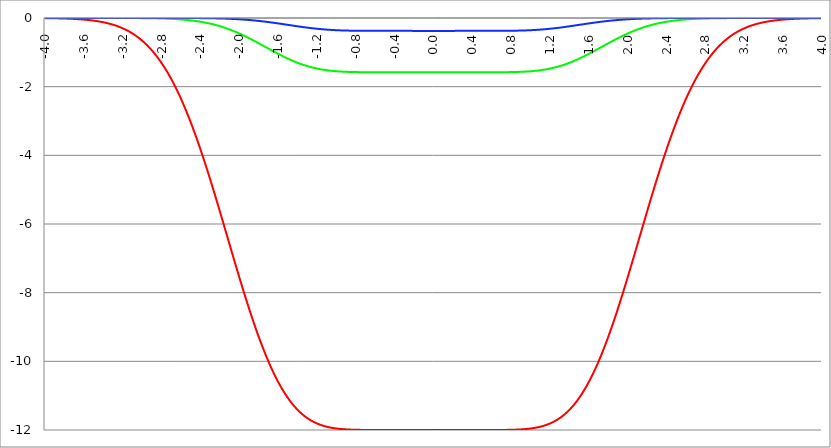
| Category | Series 1 | Series 0 | Series 2 |
|---|---|---|---|
| -4.0 | -0.005 | 0 | 0 |
| -3.996 | -0.005 | 0 | 0 |
| -3.992 | -0.005 | 0 | 0 |
| -3.988 | -0.005 | 0 | 0 |
| -3.984 | -0.005 | 0 | 0 |
| -3.98 | -0.005 | 0 | 0 |
| -3.976 | -0.006 | 0 | 0 |
| -3.972 | -0.006 | 0 | 0 |
| -3.968 | -0.006 | 0 | 0 |
| -3.964 | -0.006 | 0 | 0 |
| -3.96 | -0.006 | 0 | 0 |
| -3.956 | -0.006 | 0 | 0 |
| -3.952 | -0.006 | 0 | 0 |
| -3.948 | -0.007 | 0 | 0 |
| -3.944 | -0.007 | 0 | 0 |
| -3.94 | -0.007 | 0 | 0 |
| -3.936 | -0.007 | 0 | 0 |
| -3.932 | -0.007 | 0 | 0 |
| -3.928 | -0.007 | 0 | 0 |
| -3.924 | -0.008 | 0 | 0 |
| -3.92 | -0.008 | 0 | 0 |
| -3.916 | -0.008 | 0 | 0 |
| -3.912 | -0.008 | 0 | 0 |
| -3.908 | -0.008 | 0 | 0 |
| -3.904 | -0.009 | 0 | 0 |
| -3.9 | -0.009 | 0 | 0 |
| -3.896 | -0.009 | 0 | 0 |
| -3.892 | -0.009 | 0 | 0 |
| -3.888 | -0.009 | 0 | 0 |
| -3.884 | -0.01 | 0 | 0 |
| -3.88 | -0.01 | 0 | 0 |
| -3.876 | -0.01 | 0 | 0 |
| -3.872 | -0.01 | 0 | 0 |
| -3.868 | -0.011 | 0 | 0 |
| -3.864 | -0.011 | 0 | 0 |
| -3.86 | -0.011 | 0 | 0 |
| -3.856 | -0.011 | 0 | 0 |
| -3.852 | -0.012 | 0 | 0 |
| -3.848 | -0.012 | 0 | 0 |
| -3.844 | -0.012 | 0 | 0 |
| -3.84 | -0.012 | 0 | 0 |
| -3.836 | -0.013 | 0 | 0 |
| -3.832 | -0.013 | 0 | 0 |
| -3.828 | -0.013 | 0 | 0 |
| -3.824 | -0.014 | 0 | 0 |
| -3.82 | -0.014 | 0 | 0 |
| -3.816 | -0.014 | 0 | 0 |
| -3.812 | -0.015 | 0 | 0 |
| -3.808 | -0.015 | 0 | 0 |
| -3.804 | -0.015 | 0 | 0 |
| -3.8 | -0.016 | 0 | 0 |
| -3.796 | -0.016 | 0 | 0 |
| -3.792 | -0.016 | 0 | 0 |
| -3.788 | -0.017 | 0 | 0 |
| -3.784 | -0.017 | 0 | 0 |
| -3.78 | -0.018 | 0 | 0 |
| -3.776 | -0.018 | 0 | 0 |
| -3.772 | -0.018 | 0 | 0 |
| -3.768 | -0.019 | 0 | 0 |
| -3.764 | -0.019 | 0 | 0 |
| -3.76 | -0.02 | 0 | 0 |
| -3.756 | -0.02 | 0 | 0 |
| -3.752 | -0.02 | 0 | 0 |
| -3.748 | -0.021 | 0 | 0 |
| -3.744 | -0.021 | 0 | 0 |
| -3.74 | -0.022 | 0 | 0 |
| -3.736 | -0.022 | 0 | 0 |
| -3.732 | -0.023 | 0 | 0 |
| -3.728 | -0.023 | 0 | 0 |
| -3.724 | -0.024 | 0 | 0 |
| -3.72 | -0.024 | 0 | 0 |
| -3.716 | -0.025 | 0 | 0 |
| -3.712 | -0.025 | 0 | 0 |
| -3.708 | -0.026 | 0 | 0 |
| -3.704 | -0.027 | 0 | 0 |
| -3.7 | -0.027 | 0 | 0 |
| -3.696 | -0.028 | 0 | 0 |
| -3.692 | -0.028 | 0 | 0 |
| -3.688 | -0.029 | 0 | 0 |
| -3.684 | -0.03 | 0 | 0 |
| -3.68 | -0.03 | 0 | 0 |
| -3.676 | -0.031 | 0 | 0 |
| -3.672 | -0.032 | 0 | 0 |
| -3.668 | -0.032 | 0 | 0 |
| -3.664 | -0.033 | 0 | 0 |
| -3.66 | -0.034 | 0 | 0 |
| -3.656 | -0.034 | 0 | 0 |
| -3.652 | -0.035 | 0 | 0 |
| -3.648 | -0.036 | 0 | 0 |
| -3.644 | -0.037 | 0 | 0 |
| -3.64 | -0.037 | 0 | 0 |
| -3.636 | -0.038 | 0 | 0 |
| -3.632 | -0.039 | 0 | 0 |
| -3.628 | -0.04 | 0 | 0 |
| -3.624 | -0.041 | 0 | 0 |
| -3.62 | -0.042 | 0 | 0 |
| -3.616 | -0.043 | 0 | 0 |
| -3.612 | -0.043 | 0 | 0 |
| -3.608 | -0.044 | 0 | 0 |
| -3.604 | -0.045 | 0 | 0 |
| -3.6 | -0.046 | 0 | 0 |
| -3.596 | -0.047 | 0 | 0 |
| -3.592 | -0.048 | 0 | 0 |
| -3.588 | -0.049 | 0 | 0 |
| -3.584 | -0.05 | 0 | 0 |
| -3.58 | -0.051 | 0 | 0 |
| -3.576 | -0.052 | 0 | 0 |
| -3.572 | -0.053 | 0 | 0 |
| -3.568 | -0.054 | 0 | 0 |
| -3.564 | -0.056 | 0 | 0 |
| -3.56 | -0.057 | 0 | 0 |
| -3.556 | -0.058 | 0 | 0 |
| -3.552 | -0.059 | 0 | 0 |
| -3.548 | -0.06 | 0 | 0 |
| -3.544 | -0.061 | 0 | 0 |
| -3.54 | -0.063 | 0 | 0 |
| -3.536 | -0.064 | 0 | 0 |
| -3.532 | -0.065 | 0 | 0 |
| -3.528 | -0.067 | 0 | 0 |
| -3.524 | -0.068 | 0 | 0 |
| -3.52 | -0.069 | 0 | 0 |
| -3.516 | -0.071 | 0 | 0 |
| -3.512 | -0.072 | 0 | 0 |
| -3.508 | -0.074 | 0 | 0 |
| -3.504 | -0.075 | 0 | 0 |
| -3.5 | -0.077 | 0 | 0 |
| -3.496 | -0.078 | 0 | 0 |
| -3.492 | -0.08 | 0 | 0 |
| -3.488 | -0.081 | 0 | 0 |
| -3.484 | -0.083 | 0 | 0 |
| -3.48 | -0.084 | 0 | 0 |
| -3.476 | -0.086 | 0 | 0 |
| -3.472 | -0.088 | 0 | 0 |
| -3.467999999999999 | -0.089 | 0 | 0 |
| -3.463999999999999 | -0.091 | 0 | 0 |
| -3.459999999999999 | -0.093 | 0 | 0 |
| -3.455999999999999 | -0.095 | 0 | 0 |
| -3.451999999999999 | -0.097 | 0 | 0 |
| -3.447999999999999 | -0.099 | 0 | 0 |
| -3.443999999999999 | -0.1 | 0 | 0 |
| -3.439999999999999 | -0.102 | 0 | 0 |
| -3.435999999999999 | -0.104 | 0 | 0 |
| -3.431999999999999 | -0.106 | 0 | 0 |
| -3.427999999999999 | -0.108 | 0 | 0 |
| -3.423999999999999 | -0.111 | 0 | 0 |
| -3.419999999999999 | -0.113 | 0 | 0 |
| -3.415999999999999 | -0.115 | 0 | 0 |
| -3.411999999999999 | -0.117 | 0 | 0 |
| -3.407999999999999 | -0.119 | 0 | 0 |
| -3.403999999999999 | -0.121 | 0 | 0 |
| -3.399999999999999 | -0.124 | 0 | 0 |
| -3.395999999999999 | -0.126 | 0 | 0 |
| -3.391999999999999 | -0.128 | 0 | 0 |
| -3.387999999999999 | -0.131 | 0 | 0 |
| -3.383999999999999 | -0.133 | 0 | 0 |
| -3.379999999999999 | -0.136 | 0 | 0 |
| -3.375999999999999 | -0.138 | 0 | 0 |
| -3.371999999999999 | -0.141 | 0 | 0 |
| -3.367999999999999 | -0.144 | 0 | 0 |
| -3.363999999999999 | -0.146 | 0 | 0 |
| -3.359999999999999 | -0.149 | 0 | 0 |
| -3.355999999999999 | -0.152 | 0 | 0 |
| -3.351999999999999 | -0.154 | 0 | 0 |
| -3.347999999999999 | -0.157 | 0 | 0 |
| -3.343999999999999 | -0.16 | 0 | 0 |
| -3.339999999999999 | -0.163 | 0 | 0 |
| -3.335999999999999 | -0.166 | 0 | 0 |
| -3.331999999999999 | -0.169 | 0 | 0 |
| -3.327999999999999 | -0.172 | 0 | 0 |
| -3.323999999999999 | -0.175 | 0 | 0 |
| -3.319999999999999 | -0.179 | 0 | 0 |
| -3.315999999999999 | -0.182 | 0 | 0 |
| -3.311999999999999 | -0.185 | 0 | 0 |
| -3.307999999999999 | -0.188 | 0 | 0 |
| -3.303999999999999 | -0.192 | 0 | 0 |
| -3.299999999999999 | -0.195 | 0 | 0 |
| -3.295999999999999 | -0.199 | -0.001 | 0 |
| -3.291999999999999 | -0.202 | -0.001 | 0 |
| -3.288 | -0.206 | -0.001 | 0 |
| -3.284 | -0.209 | -0.001 | 0 |
| -3.279999999999999 | -0.213 | -0.001 | 0 |
| -3.275999999999999 | -0.217 | -0.001 | 0 |
| -3.271999999999999 | -0.221 | -0.001 | 0 |
| -3.268 | -0.225 | -0.001 | 0 |
| -3.264 | -0.229 | -0.001 | 0 |
| -3.259999999999999 | -0.233 | -0.001 | 0 |
| -3.255999999999999 | -0.237 | -0.001 | 0 |
| -3.251999999999999 | -0.241 | -0.001 | 0 |
| -3.248 | -0.245 | -0.001 | 0 |
| -3.244 | -0.249 | -0.001 | 0 |
| -3.239999999999999 | -0.254 | -0.001 | 0 |
| -3.235999999999999 | -0.258 | -0.001 | 0 |
| -3.231999999999999 | -0.262 | -0.001 | 0 |
| -3.228 | -0.267 | -0.001 | 0 |
| -3.224 | -0.271 | -0.001 | 0 |
| -3.219999999999999 | -0.276 | -0.001 | 0 |
| -3.215999999999999 | -0.281 | -0.001 | 0 |
| -3.211999999999999 | -0.286 | -0.001 | 0 |
| -3.208 | -0.29 | -0.001 | 0 |
| -3.204 | -0.295 | -0.001 | 0 |
| -3.199999999999999 | -0.3 | -0.001 | 0 |
| -3.195999999999999 | -0.305 | -0.001 | 0 |
| -3.191999999999999 | -0.311 | -0.001 | 0 |
| -3.188 | -0.316 | -0.001 | 0 |
| -3.184 | -0.321 | -0.001 | 0 |
| -3.179999999999999 | -0.326 | -0.001 | 0 |
| -3.175999999999999 | -0.332 | -0.001 | 0 |
| -3.171999999999999 | -0.337 | -0.001 | 0 |
| -3.168 | -0.343 | -0.001 | 0 |
| -3.164 | -0.349 | -0.001 | 0 |
| -3.159999999999999 | -0.354 | -0.001 | 0 |
| -3.155999999999999 | -0.36 | -0.001 | 0 |
| -3.151999999999999 | -0.366 | -0.001 | 0 |
| -3.148 | -0.372 | -0.001 | 0 |
| -3.144 | -0.378 | -0.002 | 0 |
| -3.139999999999999 | -0.384 | -0.002 | 0 |
| -3.135999999999999 | -0.391 | -0.002 | 0 |
| -3.131999999999999 | -0.397 | -0.002 | 0 |
| -3.128 | -0.403 | -0.002 | 0 |
| -3.124 | -0.41 | -0.002 | 0 |
| -3.119999999999999 | -0.416 | -0.002 | 0 |
| -3.115999999999999 | -0.423 | -0.002 | 0 |
| -3.111999999999999 | -0.43 | -0.002 | 0 |
| -3.108 | -0.437 | -0.002 | 0 |
| -3.104 | -0.444 | -0.002 | 0 |
| -3.099999999999999 | -0.451 | -0.002 | 0 |
| -3.095999999999999 | -0.458 | -0.002 | 0 |
| -3.091999999999999 | -0.465 | -0.002 | 0 |
| -3.088 | -0.472 | -0.002 | 0 |
| -3.084 | -0.48 | -0.002 | 0 |
| -3.079999999999999 | -0.487 | -0.002 | 0 |
| -3.075999999999999 | -0.495 | -0.002 | 0 |
| -3.071999999999999 | -0.503 | -0.003 | 0 |
| -3.068 | -0.51 | -0.003 | 0 |
| -3.064 | -0.518 | -0.003 | 0 |
| -3.059999999999999 | -0.526 | -0.003 | 0 |
| -3.055999999999999 | -0.535 | -0.003 | 0 |
| -3.051999999999999 | -0.543 | -0.003 | 0 |
| -3.048 | -0.551 | -0.003 | 0 |
| -3.044 | -0.56 | -0.003 | 0 |
| -3.039999999999999 | -0.568 | -0.003 | 0 |
| -3.035999999999999 | -0.577 | -0.003 | 0 |
| -3.031999999999999 | -0.585 | -0.003 | 0 |
| -3.028 | -0.594 | -0.003 | 0 |
| -3.024 | -0.603 | -0.004 | 0 |
| -3.019999999999999 | -0.612 | -0.004 | 0 |
| -3.015999999999999 | -0.622 | -0.004 | 0 |
| -3.011999999999999 | -0.631 | -0.004 | 0 |
| -3.008 | -0.64 | -0.004 | 0 |
| -3.004 | -0.65 | -0.004 | 0 |
| -2.999999999999999 | -0.66 | -0.004 | 0 |
| -2.995999999999999 | -0.669 | -0.004 | 0 |
| -2.991999999999999 | -0.679 | -0.004 | 0 |
| -2.988 | -0.689 | -0.004 | 0 |
| -2.984 | -0.699 | -0.005 | 0 |
| -2.979999999999999 | -0.71 | -0.005 | 0 |
| -2.975999999999999 | -0.72 | -0.005 | 0 |
| -2.971999999999999 | -0.73 | -0.005 | 0 |
| -2.968 | -0.741 | -0.005 | 0 |
| -2.964 | -0.752 | -0.005 | 0 |
| -2.959999999999999 | -0.763 | -0.005 | 0 |
| -2.955999999999999 | -0.774 | -0.005 | 0 |
| -2.951999999999999 | -0.785 | -0.006 | 0 |
| -2.948 | -0.796 | -0.006 | 0 |
| -2.944 | -0.807 | -0.006 | 0 |
| -2.939999999999999 | -0.819 | -0.006 | 0 |
| -2.935999999999999 | -0.831 | -0.006 | 0 |
| -2.931999999999999 | -0.842 | -0.006 | 0 |
| -2.928 | -0.854 | -0.007 | 0 |
| -2.924 | -0.866 | -0.007 | 0 |
| -2.919999999999999 | -0.878 | -0.007 | 0 |
| -2.915999999999999 | -0.891 | -0.007 | 0 |
| -2.911999999999999 | -0.903 | -0.007 | 0 |
| -2.908 | -0.916 | -0.007 | 0 |
| -2.904 | -0.928 | -0.008 | 0 |
| -2.899999999999999 | -0.941 | -0.008 | 0 |
| -2.895999999999999 | -0.954 | -0.008 | 0 |
| -2.891999999999999 | -0.967 | -0.008 | 0 |
| -2.887999999999999 | -0.981 | -0.008 | 0 |
| -2.883999999999999 | -0.994 | -0.009 | 0 |
| -2.879999999999999 | -1.008 | -0.009 | 0 |
| -2.875999999999999 | -1.021 | -0.009 | 0 |
| -2.871999999999999 | -1.035 | -0.009 | 0 |
| -2.867999999999999 | -1.049 | -0.009 | 0 |
| -2.863999999999999 | -1.063 | -0.01 | 0 |
| -2.859999999999999 | -1.078 | -0.01 | 0 |
| -2.855999999999999 | -1.092 | -0.01 | 0 |
| -2.851999999999999 | -1.107 | -0.01 | 0 |
| -2.847999999999999 | -1.121 | -0.011 | 0 |
| -2.843999999999999 | -1.136 | -0.011 | 0 |
| -2.839999999999999 | -1.151 | -0.011 | 0 |
| -2.835999999999999 | -1.166 | -0.011 | 0 |
| -2.831999999999999 | -1.182 | -0.012 | 0 |
| -2.827999999999999 | -1.197 | -0.012 | 0 |
| -2.823999999999999 | -1.213 | -0.012 | 0 |
| -2.819999999999999 | -1.229 | -0.013 | 0 |
| -2.815999999999999 | -1.245 | -0.013 | 0 |
| -2.811999999999999 | -1.261 | -0.013 | 0 |
| -2.807999999999999 | -1.277 | -0.014 | 0 |
| -2.803999999999999 | -1.293 | -0.014 | 0 |
| -2.799999999999999 | -1.31 | -0.014 | 0 |
| -2.795999999999999 | -1.327 | -0.015 | 0 |
| -2.791999999999999 | -1.344 | -0.015 | 0 |
| -2.787999999999999 | -1.361 | -0.015 | 0 |
| -2.783999999999999 | -1.378 | -0.016 | 0 |
| -2.779999999999999 | -1.395 | -0.016 | 0 |
| -2.775999999999999 | -1.413 | -0.016 | 0 |
| -2.771999999999999 | -1.431 | -0.017 | 0 |
| -2.767999999999999 | -1.448 | -0.017 | 0 |
| -2.763999999999999 | -1.466 | -0.017 | 0 |
| -2.759999999999999 | -1.485 | -0.018 | 0 |
| -2.755999999999999 | -1.503 | -0.018 | 0 |
| -2.751999999999999 | -1.522 | -0.019 | 0 |
| -2.747999999999999 | -1.54 | -0.019 | 0 |
| -2.743999999999999 | -1.559 | -0.02 | 0 |
| -2.739999999999999 | -1.578 | -0.02 | 0 |
| -2.735999999999999 | -1.597 | -0.02 | 0 |
| -2.731999999999999 | -1.617 | -0.021 | 0 |
| -2.727999999999999 | -1.636 | -0.021 | 0 |
| -2.723999999999999 | -1.656 | -0.022 | 0 |
| -2.719999999999999 | -1.676 | -0.022 | 0 |
| -2.715999999999999 | -1.696 | -0.023 | 0 |
| -2.711999999999999 | -1.716 | -0.023 | 0 |
| -2.707999999999999 | -1.736 | -0.024 | 0 |
| -2.703999999999999 | -1.757 | -0.024 | 0 |
| -2.699999999999999 | -1.778 | -0.025 | 0 |
| -2.695999999999999 | -1.799 | -0.025 | 0 |
| -2.691999999999999 | -1.82 | -0.026 | 0 |
| -2.687999999999999 | -1.841 | -0.027 | 0 |
| -2.683999999999999 | -1.862 | -0.027 | -0.001 |
| -2.679999999999999 | -1.884 | -0.028 | -0.001 |
| -2.675999999999999 | -1.906 | -0.028 | -0.001 |
| -2.671999999999999 | -1.928 | -0.029 | -0.001 |
| -2.667999999999999 | -1.95 | -0.03 | -0.001 |
| -2.663999999999999 | -1.972 | -0.03 | -0.001 |
| -2.659999999999999 | -1.994 | -0.031 | -0.001 |
| -2.655999999999999 | -2.017 | -0.032 | -0.001 |
| -2.651999999999999 | -2.04 | -0.032 | -0.001 |
| -2.647999999999999 | -2.063 | -0.033 | -0.001 |
| -2.643999999999999 | -2.086 | -0.034 | -0.001 |
| -2.639999999999999 | -2.109 | -0.034 | -0.001 |
| -2.635999999999999 | -2.133 | -0.035 | -0.001 |
| -2.631999999999999 | -2.157 | -0.036 | -0.001 |
| -2.627999999999999 | -2.18 | -0.037 | -0.001 |
| -2.623999999999999 | -2.204 | -0.037 | -0.001 |
| -2.619999999999999 | -2.229 | -0.038 | -0.001 |
| -2.615999999999999 | -2.253 | -0.039 | -0.001 |
| -2.611999999999999 | -2.278 | -0.04 | -0.001 |
| -2.607999999999999 | -2.302 | -0.041 | -0.001 |
| -2.603999999999999 | -2.327 | -0.041 | -0.001 |
| -2.599999999999999 | -2.352 | -0.042 | -0.001 |
| -2.595999999999999 | -2.378 | -0.043 | -0.001 |
| -2.591999999999999 | -2.403 | -0.044 | -0.001 |
| -2.587999999999999 | -2.429 | -0.045 | -0.001 |
| -2.583999999999999 | -2.454 | -0.046 | -0.001 |
| -2.579999999999999 | -2.48 | -0.047 | -0.001 |
| -2.575999999999999 | -2.507 | -0.048 | -0.001 |
| -2.571999999999999 | -2.533 | -0.049 | -0.001 |
| -2.567999999999999 | -2.559 | -0.05 | -0.001 |
| -2.563999999999999 | -2.586 | -0.051 | -0.001 |
| -2.559999999999999 | -2.613 | -0.052 | -0.001 |
| -2.555999999999999 | -2.64 | -0.053 | -0.001 |
| -2.551999999999999 | -2.667 | -0.054 | -0.001 |
| -2.547999999999999 | -2.694 | -0.055 | -0.001 |
| -2.543999999999999 | -2.722 | -0.056 | -0.001 |
| -2.539999999999999 | -2.75 | -0.057 | -0.002 |
| -2.535999999999999 | -2.777 | -0.058 | -0.002 |
| -2.531999999999999 | -2.806 | -0.059 | -0.002 |
| -2.527999999999999 | -2.834 | -0.06 | -0.002 |
| -2.523999999999999 | -2.862 | -0.061 | -0.002 |
| -2.519999999999999 | -2.891 | -0.063 | -0.002 |
| -2.515999999999999 | -2.919 | -0.064 | -0.002 |
| -2.511999999999999 | -2.948 | -0.065 | -0.002 |
| -2.507999999999999 | -2.977 | -0.066 | -0.002 |
| -2.503999999999999 | -3.006 | -0.068 | -0.002 |
| -2.499999999999999 | -3.036 | -0.069 | -0.002 |
| -2.495999999999999 | -3.065 | -0.07 | -0.002 |
| -2.491999999999999 | -3.095 | -0.071 | -0.002 |
| -2.487999999999999 | -3.125 | -0.073 | -0.002 |
| -2.483999999999999 | -3.155 | -0.074 | -0.002 |
| -2.479999999999999 | -3.185 | -0.076 | -0.002 |
| -2.475999999999999 | -3.216 | -0.077 | -0.002 |
| -2.471999999999999 | -3.246 | -0.078 | -0.002 |
| -2.467999999999999 | -3.277 | -0.08 | -0.003 |
| -2.463999999999999 | -3.308 | -0.081 | -0.003 |
| -2.459999999999999 | -3.339 | -0.083 | -0.003 |
| -2.455999999999999 | -3.37 | -0.084 | -0.003 |
| -2.451999999999999 | -3.401 | -0.086 | -0.003 |
| -2.447999999999999 | -3.432 | -0.087 | -0.003 |
| -2.443999999999999 | -3.464 | -0.089 | -0.003 |
| -2.439999999999999 | -3.496 | -0.091 | -0.003 |
| -2.435999999999999 | -3.528 | -0.092 | -0.003 |
| -2.431999999999999 | -3.56 | -0.094 | -0.003 |
| -2.427999999999999 | -3.592 | -0.096 | -0.003 |
| -2.423999999999999 | -3.624 | -0.097 | -0.003 |
| -2.419999999999999 | -3.657 | -0.099 | -0.003 |
| -2.415999999999999 | -3.69 | -0.101 | -0.004 |
| -2.411999999999999 | -3.722 | -0.103 | -0.004 |
| -2.407999999999999 | -3.755 | -0.104 | -0.004 |
| -2.403999999999999 | -3.788 | -0.106 | -0.004 |
| -2.399999999999999 | -3.822 | -0.108 | -0.004 |
| -2.395999999999999 | -3.855 | -0.11 | -0.004 |
| -2.391999999999999 | -3.888 | -0.112 | -0.004 |
| -2.387999999999999 | -3.922 | -0.114 | -0.004 |
| -2.383999999999999 | -3.956 | -0.116 | -0.004 |
| -2.379999999999999 | -3.99 | -0.118 | -0.005 |
| -2.375999999999999 | -4.024 | -0.12 | -0.005 |
| -2.371999999999999 | -4.058 | -0.122 | -0.005 |
| -2.367999999999998 | -4.092 | -0.124 | -0.005 |
| -2.363999999999998 | -4.127 | -0.126 | -0.005 |
| -2.359999999999998 | -4.161 | -0.128 | -0.005 |
| -2.355999999999998 | -4.196 | -0.13 | -0.005 |
| -2.351999999999998 | -4.231 | -0.132 | -0.005 |
| -2.347999999999998 | -4.266 | -0.135 | -0.006 |
| -2.343999999999998 | -4.301 | -0.137 | -0.006 |
| -2.339999999999998 | -4.336 | -0.139 | -0.006 |
| -2.335999999999998 | -4.371 | -0.141 | -0.006 |
| -2.331999999999998 | -4.407 | -0.144 | -0.006 |
| -2.327999999999998 | -4.442 | -0.146 | -0.006 |
| -2.323999999999998 | -4.478 | -0.148 | -0.006 |
| -2.319999999999998 | -4.514 | -0.151 | -0.007 |
| -2.315999999999998 | -4.549 | -0.153 | -0.007 |
| -2.311999999999998 | -4.585 | -0.156 | -0.007 |
| -2.307999999999998 | -4.621 | -0.158 | -0.007 |
| -2.303999999999998 | -4.658 | -0.161 | -0.007 |
| -2.299999999999998 | -4.694 | -0.163 | -0.008 |
| -2.295999999999998 | -4.73 | -0.166 | -0.008 |
| -2.291999999999998 | -4.767 | -0.169 | -0.008 |
| -2.287999999999998 | -4.803 | -0.171 | -0.008 |
| -2.283999999999998 | -4.84 | -0.174 | -0.008 |
| -2.279999999999998 | -4.877 | -0.177 | -0.008 |
| -2.275999999999998 | -4.914 | -0.179 | -0.009 |
| -2.271999999999998 | -4.951 | -0.182 | -0.009 |
| -2.267999999999998 | -4.988 | -0.185 | -0.009 |
| -2.263999999999998 | -5.025 | -0.188 | -0.009 |
| -2.259999999999998 | -5.062 | -0.191 | -0.01 |
| -2.255999999999998 | -5.099 | -0.194 | -0.01 |
| -2.251999999999998 | -5.136 | -0.197 | -0.01 |
| -2.247999999999998 | -5.174 | -0.2 | -0.01 |
| -2.243999999999998 | -5.211 | -0.203 | -0.01 |
| -2.239999999999998 | -5.249 | -0.206 | -0.011 |
| -2.235999999999998 | -5.287 | -0.209 | -0.011 |
| -2.231999999999998 | -5.324 | -0.212 | -0.011 |
| -2.227999999999998 | -5.362 | -0.215 | -0.011 |
| -2.223999999999998 | -5.4 | -0.218 | -0.012 |
| -2.219999999999998 | -5.438 | -0.221 | -0.012 |
| -2.215999999999998 | -5.476 | -0.225 | -0.012 |
| -2.211999999999998 | -5.514 | -0.228 | -0.013 |
| -2.207999999999998 | -5.552 | -0.231 | -0.013 |
| -2.203999999999998 | -5.59 | -0.235 | -0.013 |
| -2.199999999999998 | -5.628 | -0.238 | -0.013 |
| -2.195999999999998 | -5.666 | -0.241 | -0.014 |
| -2.191999999999998 | -5.704 | -0.245 | -0.014 |
| -2.187999999999998 | -5.743 | -0.248 | -0.014 |
| -2.183999999999998 | -5.781 | -0.252 | -0.015 |
| -2.179999999999998 | -5.819 | -0.255 | -0.015 |
| -2.175999999999998 | -5.858 | -0.259 | -0.015 |
| -2.171999999999998 | -5.896 | -0.263 | -0.016 |
| -2.167999999999998 | -5.935 | -0.266 | -0.016 |
| -2.163999999999998 | -5.973 | -0.27 | -0.016 |
| -2.159999999999998 | -6.012 | -0.274 | -0.017 |
| -2.155999999999998 | -6.05 | -0.277 | -0.017 |
| -2.151999999999998 | -6.089 | -0.281 | -0.018 |
| -2.147999999999998 | -6.128 | -0.285 | -0.018 |
| -2.143999999999998 | -6.166 | -0.289 | -0.018 |
| -2.139999999999998 | -6.205 | -0.293 | -0.019 |
| -2.135999999999998 | -6.243 | -0.297 | -0.019 |
| -2.131999999999998 | -6.282 | -0.301 | -0.019 |
| -2.127999999999998 | -6.321 | -0.305 | -0.02 |
| -2.123999999999998 | -6.359 | -0.309 | -0.02 |
| -2.119999999999998 | -6.398 | -0.313 | -0.021 |
| -2.115999999999998 | -6.437 | -0.317 | -0.021 |
| -2.111999999999998 | -6.475 | -0.321 | -0.022 |
| -2.107999999999998 | -6.514 | -0.325 | -0.022 |
| -2.103999999999998 | -6.553 | -0.329 | -0.023 |
| -2.099999999999998 | -6.591 | -0.334 | -0.023 |
| -2.095999999999998 | -6.63 | -0.338 | -0.023 |
| -2.091999999999998 | -6.668 | -0.342 | -0.024 |
| -2.087999999999998 | -6.707 | -0.347 | -0.024 |
| -2.083999999999998 | -6.746 | -0.351 | -0.025 |
| -2.079999999999998 | -6.784 | -0.355 | -0.025 |
| -2.075999999999998 | -6.823 | -0.36 | -0.026 |
| -2.071999999999998 | -6.861 | -0.364 | -0.026 |
| -2.067999999999998 | -6.9 | -0.369 | -0.027 |
| -2.063999999999998 | -6.938 | -0.373 | -0.028 |
| -2.059999999999998 | -6.976 | -0.378 | -0.028 |
| -2.055999999999998 | -7.015 | -0.382 | -0.029 |
| -2.051999999999998 | -7.053 | -0.387 | -0.029 |
| -2.047999999999998 | -7.091 | -0.392 | -0.03 |
| -2.043999999999998 | -7.129 | -0.397 | -0.03 |
| -2.039999999999998 | -7.168 | -0.401 | -0.031 |
| -2.035999999999998 | -7.206 | -0.406 | -0.032 |
| -2.031999999999998 | -7.244 | -0.411 | -0.032 |
| -2.027999999999998 | -7.282 | -0.416 | -0.033 |
| -2.023999999999998 | -7.32 | -0.421 | -0.033 |
| -2.019999999999998 | -7.358 | -0.425 | -0.034 |
| -2.015999999999998 | -7.395 | -0.43 | -0.035 |
| -2.011999999999998 | -7.433 | -0.435 | -0.035 |
| -2.007999999999998 | -7.471 | -0.44 | -0.036 |
| -2.003999999999998 | -7.508 | -0.445 | -0.037 |
| -1.999999999999998 | -7.546 | -0.45 | -0.037 |
| -1.995999999999998 | -7.584 | -0.456 | -0.038 |
| -1.991999999999998 | -7.621 | -0.461 | -0.039 |
| -1.987999999999998 | -7.658 | -0.466 | -0.039 |
| -1.983999999999998 | -7.695 | -0.471 | -0.04 |
| -1.979999999999998 | -7.733 | -0.476 | -0.041 |
| -1.975999999999998 | -7.77 | -0.481 | -0.042 |
| -1.971999999999998 | -7.807 | -0.487 | -0.042 |
| -1.967999999999998 | -7.844 | -0.492 | -0.043 |
| -1.963999999999998 | -7.88 | -0.497 | -0.044 |
| -1.959999999999998 | -7.917 | -0.503 | -0.045 |
| -1.955999999999998 | -7.954 | -0.508 | -0.046 |
| -1.951999999999998 | -7.99 | -0.513 | -0.046 |
| -1.947999999999998 | -8.026 | -0.519 | -0.047 |
| -1.943999999999998 | -8.063 | -0.524 | -0.048 |
| -1.939999999999998 | -8.099 | -0.53 | -0.049 |
| -1.935999999999998 | -8.135 | -0.535 | -0.05 |
| -1.931999999999998 | -8.171 | -0.541 | -0.05 |
| -1.927999999999998 | -8.207 | -0.547 | -0.051 |
| -1.923999999999998 | -8.243 | -0.552 | -0.052 |
| -1.919999999999998 | -8.278 | -0.558 | -0.053 |
| -1.915999999999998 | -8.314 | -0.563 | -0.054 |
| -1.911999999999998 | -8.349 | -0.569 | -0.055 |
| -1.907999999999998 | -8.384 | -0.575 | -0.056 |
| -1.903999999999998 | -8.419 | -0.58 | -0.057 |
| -1.899999999999998 | -8.454 | -0.586 | -0.058 |
| -1.895999999999998 | -8.489 | -0.592 | -0.059 |
| -1.891999999999998 | -8.524 | -0.598 | -0.06 |
| -1.887999999999998 | -8.558 | -0.603 | -0.061 |
| -1.883999999999998 | -8.593 | -0.609 | -0.062 |
| -1.879999999999998 | -8.627 | -0.615 | -0.063 |
| -1.875999999999998 | -8.661 | -0.621 | -0.064 |
| -1.871999999999998 | -8.695 | -0.627 | -0.065 |
| -1.867999999999998 | -8.729 | -0.633 | -0.066 |
| -1.863999999999998 | -8.763 | -0.639 | -0.067 |
| -1.859999999999998 | -8.797 | -0.645 | -0.068 |
| -1.855999999999998 | -8.83 | -0.651 | -0.069 |
| -1.851999999999998 | -8.863 | -0.657 | -0.07 |
| -1.847999999999998 | -8.896 | -0.663 | -0.071 |
| -1.843999999999998 | -8.929 | -0.669 | -0.072 |
| -1.839999999999998 | -8.962 | -0.675 | -0.073 |
| -1.835999999999998 | -8.995 | -0.681 | -0.074 |
| -1.831999999999998 | -9.027 | -0.687 | -0.075 |
| -1.827999999999998 | -9.06 | -0.693 | -0.076 |
| -1.823999999999998 | -9.092 | -0.699 | -0.078 |
| -1.819999999999998 | -9.124 | -0.705 | -0.079 |
| -1.815999999999998 | -9.156 | -0.711 | -0.08 |
| -1.811999999999998 | -9.187 | -0.717 | -0.081 |
| -1.807999999999998 | -9.219 | -0.723 | -0.082 |
| -1.803999999999998 | -9.25 | -0.729 | -0.084 |
| -1.799999999999998 | -9.281 | -0.735 | -0.085 |
| -1.795999999999998 | -9.312 | -0.742 | -0.086 |
| -1.791999999999998 | -9.343 | -0.748 | -0.087 |
| -1.787999999999998 | -9.374 | -0.754 | -0.088 |
| -1.783999999999998 | -9.404 | -0.76 | -0.09 |
| -1.779999999999998 | -9.435 | -0.766 | -0.091 |
| -1.775999999999998 | -9.465 | -0.772 | -0.092 |
| -1.771999999999998 | -9.495 | -0.779 | -0.093 |
| -1.767999999999998 | -9.524 | -0.785 | -0.095 |
| -1.763999999999998 | -9.554 | -0.791 | -0.096 |
| -1.759999999999998 | -9.583 | -0.797 | -0.097 |
| -1.755999999999998 | -9.612 | -0.804 | -0.099 |
| -1.751999999999998 | -9.641 | -0.81 | -0.1 |
| -1.747999999999998 | -9.67 | -0.816 | -0.101 |
| -1.743999999999998 | -9.699 | -0.822 | -0.103 |
| -1.739999999999998 | -9.727 | -0.828 | -0.104 |
| -1.735999999999998 | -9.755 | -0.835 | -0.106 |
| -1.731999999999998 | -9.784 | -0.841 | -0.107 |
| -1.727999999999998 | -9.811 | -0.847 | -0.108 |
| -1.723999999999998 | -9.839 | -0.853 | -0.11 |
| -1.719999999999998 | -9.866 | -0.86 | -0.111 |
| -1.715999999999998 | -9.894 | -0.866 | -0.113 |
| -1.711999999999998 | -9.921 | -0.872 | -0.114 |
| -1.707999999999998 | -9.948 | -0.878 | -0.115 |
| -1.703999999999998 | -9.974 | -0.885 | -0.117 |
| -1.699999999999998 | -10.001 | -0.891 | -0.118 |
| -1.695999999999998 | -10.027 | -0.897 | -0.12 |
| -1.691999999999998 | -10.053 | -0.903 | -0.121 |
| -1.687999999999998 | -10.079 | -0.909 | -0.123 |
| -1.683999999999998 | -10.105 | -0.916 | -0.124 |
| -1.679999999999998 | -10.13 | -0.922 | -0.126 |
| -1.675999999999998 | -10.155 | -0.928 | -0.127 |
| -1.671999999999998 | -10.18 | -0.934 | -0.129 |
| -1.667999999999998 | -10.205 | -0.94 | -0.13 |
| -1.663999999999998 | -10.23 | -0.946 | -0.132 |
| -1.659999999999998 | -10.254 | -0.953 | -0.133 |
| -1.655999999999998 | -10.279 | -0.959 | -0.135 |
| -1.651999999999998 | -10.303 | -0.965 | -0.137 |
| -1.647999999999998 | -10.326 | -0.971 | -0.138 |
| -1.643999999999998 | -10.35 | -0.977 | -0.14 |
| -1.639999999999998 | -10.373 | -0.983 | -0.141 |
| -1.635999999999998 | -10.397 | -0.989 | -0.143 |
| -1.631999999999998 | -10.42 | -0.995 | -0.144 |
| -1.627999999999998 | -10.442 | -1.001 | -0.146 |
| -1.623999999999998 | -10.465 | -1.007 | -0.148 |
| -1.619999999999998 | -10.487 | -1.013 | -0.149 |
| -1.615999999999998 | -10.51 | -1.019 | -0.151 |
| -1.611999999999998 | -10.532 | -1.025 | -0.152 |
| -1.607999999999998 | -10.553 | -1.031 | -0.154 |
| -1.603999999999998 | -10.575 | -1.037 | -0.156 |
| -1.599999999999998 | -10.596 | -1.043 | -0.157 |
| -1.595999999999998 | -10.617 | -1.049 | -0.159 |
| -1.591999999999998 | -10.638 | -1.055 | -0.161 |
| -1.587999999999998 | -10.659 | -1.061 | -0.162 |
| -1.583999999999998 | -10.68 | -1.067 | -0.164 |
| -1.579999999999998 | -10.7 | -1.072 | -0.166 |
| -1.575999999999998 | -10.72 | -1.078 | -0.167 |
| -1.571999999999998 | -10.74 | -1.084 | -0.169 |
| -1.567999999999998 | -10.76 | -1.09 | -0.171 |
| -1.563999999999998 | -10.779 | -1.095 | -0.172 |
| -1.559999999999998 | -10.798 | -1.101 | -0.174 |
| -1.555999999999998 | -10.818 | -1.107 | -0.176 |
| -1.551999999999998 | -10.836 | -1.112 | -0.177 |
| -1.547999999999998 | -10.855 | -1.118 | -0.179 |
| -1.543999999999998 | -10.874 | -1.124 | -0.181 |
| -1.539999999999998 | -10.892 | -1.129 | -0.182 |
| -1.535999999999998 | -10.91 | -1.135 | -0.184 |
| -1.531999999999998 | -10.928 | -1.14 | -0.186 |
| -1.527999999999998 | -10.946 | -1.146 | -0.188 |
| -1.523999999999998 | -10.963 | -1.151 | -0.189 |
| -1.519999999999998 | -10.98 | -1.157 | -0.191 |
| -1.515999999999998 | -10.997 | -1.162 | -0.193 |
| -1.511999999999998 | -11.014 | -1.167 | -0.194 |
| -1.507999999999998 | -11.031 | -1.173 | -0.196 |
| -1.503999999999998 | -11.048 | -1.178 | -0.198 |
| -1.499999999999998 | -11.064 | -1.183 | -0.2 |
| -1.495999999999998 | -11.08 | -1.189 | -0.201 |
| -1.491999999999998 | -11.096 | -1.194 | -0.203 |
| -1.487999999999998 | -11.112 | -1.199 | -0.205 |
| -1.483999999999998 | -11.127 | -1.204 | -0.206 |
| -1.479999999999998 | -11.142 | -1.209 | -0.208 |
| -1.475999999999998 | -11.158 | -1.214 | -0.21 |
| -1.471999999999998 | -11.173 | -1.219 | -0.211 |
| -1.467999999999998 | -11.187 | -1.224 | -0.213 |
| -1.463999999999998 | -11.202 | -1.229 | -0.215 |
| -1.459999999999998 | -11.216 | -1.234 | -0.217 |
| -1.455999999999998 | -11.231 | -1.239 | -0.218 |
| -1.451999999999998 | -11.245 | -1.244 | -0.22 |
| -1.447999999999998 | -11.258 | -1.249 | -0.222 |
| -1.443999999999998 | -11.272 | -1.254 | -0.223 |
| -1.439999999999998 | -11.286 | -1.258 | -0.225 |
| -1.435999999999998 | -11.299 | -1.263 | -0.227 |
| -1.431999999999998 | -11.312 | -1.268 | -0.228 |
| -1.427999999999998 | -11.325 | -1.273 | -0.23 |
| -1.423999999999998 | -11.338 | -1.277 | -0.232 |
| -1.419999999999998 | -11.35 | -1.282 | -0.233 |
| -1.415999999999998 | -11.363 | -1.286 | -0.235 |
| -1.411999999999998 | -11.375 | -1.291 | -0.237 |
| -1.407999999999998 | -11.387 | -1.295 | -0.238 |
| -1.403999999999998 | -11.399 | -1.3 | -0.24 |
| -1.399999999999998 | -11.411 | -1.304 | -0.242 |
| -1.395999999999998 | -11.422 | -1.308 | -0.243 |
| -1.391999999999998 | -11.434 | -1.313 | -0.245 |
| -1.387999999999998 | -11.445 | -1.317 | -0.247 |
| -1.383999999999998 | -11.456 | -1.321 | -0.248 |
| -1.379999999999998 | -11.467 | -1.325 | -0.25 |
| -1.375999999999998 | -11.477 | -1.33 | -0.251 |
| -1.371999999999998 | -11.488 | -1.334 | -0.253 |
| -1.367999999999998 | -11.498 | -1.338 | -0.255 |
| -1.363999999999998 | -11.509 | -1.342 | -0.256 |
| -1.359999999999998 | -11.519 | -1.346 | -0.258 |
| -1.355999999999998 | -11.529 | -1.35 | -0.259 |
| -1.351999999999998 | -11.538 | -1.354 | -0.261 |
| -1.347999999999998 | -11.548 | -1.358 | -0.262 |
| -1.343999999999998 | -11.558 | -1.361 | -0.264 |
| -1.339999999999998 | -11.567 | -1.365 | -0.266 |
| -1.335999999999998 | -11.576 | -1.369 | -0.267 |
| -1.331999999999998 | -11.585 | -1.373 | -0.269 |
| -1.327999999999998 | -11.594 | -1.376 | -0.27 |
| -1.323999999999998 | -11.603 | -1.38 | -0.272 |
| -1.319999999999998 | -11.611 | -1.383 | -0.273 |
| -1.315999999999998 | -11.62 | -1.387 | -0.275 |
| -1.311999999999998 | -11.628 | -1.391 | -0.276 |
| -1.307999999999998 | -11.636 | -1.394 | -0.278 |
| -1.303999999999998 | -11.644 | -1.397 | -0.279 |
| -1.299999999999998 | -11.652 | -1.401 | -0.28 |
| -1.295999999999998 | -11.66 | -1.404 | -0.282 |
| -1.291999999999998 | -11.668 | -1.407 | -0.283 |
| -1.287999999999998 | -11.675 | -1.411 | -0.285 |
| -1.283999999999998 | -11.682 | -1.414 | -0.286 |
| -1.279999999999998 | -11.69 | -1.417 | -0.288 |
| -1.275999999999998 | -11.697 | -1.42 | -0.289 |
| -1.271999999999998 | -11.704 | -1.423 | -0.29 |
| -1.267999999999998 | -11.711 | -1.426 | -0.292 |
| -1.263999999999998 | -11.717 | -1.429 | -0.293 |
| -1.259999999999998 | -11.724 | -1.432 | -0.294 |
| -1.255999999999998 | -11.73 | -1.435 | -0.296 |
| -1.251999999999998 | -11.737 | -1.438 | -0.297 |
| -1.247999999999998 | -11.743 | -1.441 | -0.298 |
| -1.243999999999998 | -11.749 | -1.444 | -0.3 |
| -1.239999999999998 | -11.755 | -1.447 | -0.301 |
| -1.235999999999998 | -11.761 | -1.449 | -0.302 |
| -1.231999999999998 | -11.767 | -1.452 | -0.303 |
| -1.227999999999998 | -11.773 | -1.455 | -0.305 |
| -1.223999999999998 | -11.778 | -1.457 | -0.306 |
| -1.219999999999998 | -11.784 | -1.46 | -0.307 |
| -1.215999999999998 | -11.789 | -1.463 | -0.308 |
| -1.211999999999998 | -11.794 | -1.465 | -0.31 |
| -1.207999999999998 | -11.799 | -1.468 | -0.311 |
| -1.203999999999998 | -11.804 | -1.47 | -0.312 |
| -1.199999999999997 | -11.809 | -1.472 | -0.313 |
| -1.195999999999997 | -11.814 | -1.475 | -0.314 |
| -1.191999999999997 | -11.819 | -1.477 | -0.315 |
| -1.187999999999997 | -11.824 | -1.479 | -0.317 |
| -1.183999999999997 | -11.828 | -1.482 | -0.318 |
| -1.179999999999997 | -11.833 | -1.484 | -0.319 |
| -1.175999999999997 | -11.837 | -1.486 | -0.32 |
| -1.171999999999997 | -11.841 | -1.488 | -0.321 |
| -1.167999999999997 | -11.845 | -1.49 | -0.322 |
| -1.163999999999997 | -11.849 | -1.492 | -0.323 |
| -1.159999999999997 | -11.853 | -1.494 | -0.324 |
| -1.155999999999997 | -11.857 | -1.496 | -0.325 |
| -1.151999999999997 | -11.861 | -1.498 | -0.326 |
| -1.147999999999997 | -11.865 | -1.5 | -0.327 |
| -1.143999999999997 | -11.869 | -1.502 | -0.328 |
| -1.139999999999997 | -11.872 | -1.504 | -0.329 |
| -1.135999999999997 | -11.876 | -1.506 | -0.33 |
| -1.131999999999997 | -11.879 | -1.508 | -0.331 |
| -1.127999999999997 | -11.882 | -1.509 | -0.332 |
| -1.123999999999997 | -11.886 | -1.511 | -0.333 |
| -1.119999999999997 | -11.889 | -1.513 | -0.334 |
| -1.115999999999997 | -11.892 | -1.515 | -0.335 |
| -1.111999999999997 | -11.895 | -1.516 | -0.336 |
| -1.107999999999997 | -11.898 | -1.518 | -0.336 |
| -1.103999999999997 | -11.901 | -1.519 | -0.337 |
| -1.099999999999997 | -11.904 | -1.521 | -0.338 |
| -1.095999999999997 | -11.907 | -1.523 | -0.339 |
| -1.091999999999997 | -11.909 | -1.524 | -0.34 |
| -1.087999999999997 | -11.912 | -1.525 | -0.341 |
| -1.083999999999997 | -11.915 | -1.527 | -0.341 |
| -1.079999999999997 | -11.917 | -1.528 | -0.342 |
| -1.075999999999997 | -11.92 | -1.53 | -0.343 |
| -1.071999999999997 | -11.922 | -1.531 | -0.344 |
| -1.067999999999997 | -11.924 | -1.532 | -0.344 |
| -1.063999999999997 | -11.927 | -1.534 | -0.345 |
| -1.059999999999997 | -11.929 | -1.535 | -0.346 |
| -1.055999999999997 | -11.931 | -1.536 | -0.347 |
| -1.051999999999997 | -11.933 | -1.537 | -0.347 |
| -1.047999999999997 | -11.935 | -1.539 | -0.348 |
| -1.043999999999997 | -11.937 | -1.54 | -0.349 |
| -1.039999999999997 | -11.939 | -1.541 | -0.349 |
| -1.035999999999997 | -11.941 | -1.542 | -0.35 |
| -1.031999999999997 | -11.943 | -1.543 | -0.351 |
| -1.027999999999997 | -11.945 | -1.544 | -0.351 |
| -1.023999999999997 | -11.946 | -1.545 | -0.352 |
| -1.019999999999997 | -11.948 | -1.546 | -0.352 |
| -1.015999999999997 | -11.95 | -1.547 | -0.353 |
| -1.011999999999997 | -11.951 | -1.548 | -0.354 |
| -1.007999999999997 | -11.953 | -1.549 | -0.354 |
| -1.003999999999997 | -11.955 | -1.55 | -0.355 |
| -0.999999999999997 | -11.956 | -1.551 | -0.355 |
| -0.995999999999997 | -11.958 | -1.552 | -0.356 |
| -0.991999999999997 | -11.959 | -1.553 | -0.356 |
| -0.987999999999997 | -11.96 | -1.553 | -0.357 |
| -0.983999999999997 | -11.962 | -1.554 | -0.357 |
| -0.979999999999997 | -11.963 | -1.555 | -0.358 |
| -0.975999999999997 | -11.964 | -1.556 | -0.358 |
| -0.971999999999997 | -11.965 | -1.557 | -0.359 |
| -0.967999999999997 | -11.967 | -1.557 | -0.359 |
| -0.963999999999997 | -11.968 | -1.558 | -0.36 |
| -0.959999999999997 | -11.969 | -1.559 | -0.36 |
| -0.955999999999997 | -11.97 | -1.559 | -0.361 |
| -0.951999999999997 | -11.971 | -1.56 | -0.361 |
| -0.947999999999997 | -11.972 | -1.561 | -0.361 |
| -0.943999999999997 | -11.973 | -1.561 | -0.362 |
| -0.939999999999997 | -11.974 | -1.562 | -0.362 |
| -0.935999999999997 | -11.975 | -1.563 | -0.363 |
| -0.931999999999997 | -11.976 | -1.563 | -0.363 |
| -0.927999999999997 | -11.977 | -1.564 | -0.363 |
| -0.923999999999997 | -11.978 | -1.564 | -0.364 |
| -0.919999999999997 | -11.978 | -1.565 | -0.364 |
| -0.915999999999997 | -11.979 | -1.565 | -0.364 |
| -0.911999999999997 | -11.98 | -1.566 | -0.365 |
| -0.907999999999997 | -11.981 | -1.566 | -0.365 |
| -0.903999999999997 | -11.981 | -1.567 | -0.365 |
| -0.899999999999997 | -11.982 | -1.567 | -0.366 |
| -0.895999999999997 | -11.983 | -1.568 | -0.366 |
| -0.891999999999997 | -11.983 | -1.568 | -0.366 |
| -0.887999999999997 | -11.984 | -1.569 | -0.367 |
| -0.883999999999997 | -11.985 | -1.569 | -0.367 |
| -0.879999999999997 | -11.985 | -1.57 | -0.367 |
| -0.875999999999997 | -11.986 | -1.57 | -0.367 |
| -0.871999999999997 | -11.986 | -1.57 | -0.368 |
| -0.867999999999997 | -11.987 | -1.571 | -0.368 |
| -0.863999999999997 | -11.987 | -1.571 | -0.368 |
| -0.859999999999997 | -11.988 | -1.571 | -0.368 |
| -0.855999999999997 | -11.988 | -1.572 | -0.369 |
| -0.851999999999997 | -11.989 | -1.572 | -0.369 |
| -0.847999999999997 | -11.989 | -1.572 | -0.369 |
| -0.843999999999997 | -11.99 | -1.573 | -0.369 |
| -0.839999999999997 | -11.99 | -1.573 | -0.369 |
| -0.835999999999997 | -11.991 | -1.573 | -0.37 |
| -0.831999999999997 | -11.991 | -1.573 | -0.37 |
| -0.827999999999997 | -11.991 | -1.574 | -0.37 |
| -0.823999999999997 | -11.992 | -1.574 | -0.37 |
| -0.819999999999997 | -11.992 | -1.574 | -0.37 |
| -0.815999999999997 | -11.992 | -1.574 | -0.371 |
| -0.811999999999997 | -11.993 | -1.575 | -0.371 |
| -0.807999999999997 | -11.993 | -1.575 | -0.371 |
| -0.803999999999997 | -11.993 | -1.575 | -0.371 |
| -0.799999999999997 | -11.994 | -1.575 | -0.371 |
| -0.795999999999997 | -11.994 | -1.576 | -0.371 |
| -0.791999999999997 | -11.994 | -1.576 | -0.372 |
| -0.787999999999997 | -11.994 | -1.576 | -0.372 |
| -0.783999999999997 | -11.995 | -1.576 | -0.372 |
| -0.779999999999997 | -11.995 | -1.576 | -0.372 |
| -0.775999999999997 | -11.995 | -1.576 | -0.372 |
| -0.771999999999997 | -11.995 | -1.577 | -0.372 |
| -0.767999999999997 | -11.996 | -1.577 | -0.372 |
| -0.763999999999997 | -11.996 | -1.577 | -0.372 |
| -0.759999999999997 | -11.996 | -1.577 | -0.373 |
| -0.755999999999997 | -11.996 | -1.577 | -0.373 |
| -0.751999999999997 | -11.996 | -1.577 | -0.373 |
| -0.747999999999997 | -11.997 | -1.578 | -0.373 |
| -0.743999999999997 | -11.997 | -1.578 | -0.373 |
| -0.739999999999997 | -11.997 | -1.578 | -0.373 |
| -0.735999999999997 | -11.997 | -1.578 | -0.373 |
| -0.731999999999997 | -11.997 | -1.578 | -0.373 |
| -0.727999999999997 | -11.997 | -1.578 | -0.373 |
| -0.723999999999997 | -11.997 | -1.578 | -0.373 |
| -0.719999999999997 | -11.998 | -1.578 | -0.373 |
| -0.715999999999997 | -11.998 | -1.578 | -0.373 |
| -0.711999999999997 | -11.998 | -1.578 | -0.374 |
| -0.707999999999997 | -11.998 | -1.579 | -0.374 |
| -0.703999999999997 | -11.998 | -1.579 | -0.374 |
| -0.699999999999997 | -11.998 | -1.579 | -0.374 |
| -0.695999999999997 | -11.998 | -1.579 | -0.374 |
| -0.691999999999997 | -11.998 | -1.579 | -0.374 |
| -0.687999999999997 | -11.998 | -1.579 | -0.374 |
| -0.683999999999997 | -11.998 | -1.579 | -0.374 |
| -0.679999999999997 | -11.999 | -1.579 | -0.374 |
| -0.675999999999997 | -11.999 | -1.579 | -0.374 |
| -0.671999999999997 | -11.999 | -1.579 | -0.374 |
| -0.667999999999997 | -11.999 | -1.579 | -0.374 |
| -0.663999999999997 | -11.999 | -1.579 | -0.374 |
| -0.659999999999997 | -11.999 | -1.579 | -0.374 |
| -0.655999999999997 | -11.999 | -1.579 | -0.374 |
| -0.651999999999997 | -11.999 | -1.579 | -0.374 |
| -0.647999999999997 | -11.999 | -1.579 | -0.374 |
| -0.643999999999997 | -11.999 | -1.58 | -0.374 |
| -0.639999999999997 | -11.999 | -1.58 | -0.374 |
| -0.635999999999997 | -11.999 | -1.58 | -0.374 |
| -0.631999999999997 | -11.999 | -1.58 | -0.374 |
| -0.627999999999997 | -11.999 | -1.58 | -0.375 |
| -0.623999999999997 | -11.999 | -1.58 | -0.375 |
| -0.619999999999997 | -11.999 | -1.58 | -0.375 |
| -0.615999999999997 | -11.999 | -1.58 | -0.375 |
| -0.611999999999997 | -11.999 | -1.58 | -0.375 |
| -0.607999999999997 | -11.999 | -1.58 | -0.375 |
| -0.603999999999997 | -12 | -1.58 | -0.375 |
| -0.599999999999997 | -12 | -1.58 | -0.375 |
| -0.595999999999997 | -12 | -1.58 | -0.375 |
| -0.591999999999997 | -12 | -1.58 | -0.375 |
| -0.587999999999997 | -12 | -1.58 | -0.375 |
| -0.583999999999997 | -12 | -1.58 | -0.375 |
| -0.579999999999997 | -12 | -1.58 | -0.375 |
| -0.575999999999997 | -12 | -1.58 | -0.375 |
| -0.571999999999997 | -12 | -1.58 | -0.375 |
| -0.567999999999997 | -12 | -1.58 | -0.375 |
| -0.563999999999997 | -12 | -1.58 | -0.375 |
| -0.559999999999997 | -12 | -1.58 | -0.375 |
| -0.555999999999997 | -12 | -1.58 | -0.375 |
| -0.551999999999997 | -12 | -1.58 | -0.375 |
| -0.547999999999997 | -12 | -1.58 | -0.375 |
| -0.543999999999997 | -12 | -1.58 | -0.375 |
| -0.539999999999997 | -12 | -1.58 | -0.375 |
| -0.535999999999997 | -12 | -1.58 | -0.375 |
| -0.531999999999997 | -12 | -1.58 | -0.375 |
| -0.527999999999997 | -12 | -1.58 | -0.375 |
| -0.523999999999997 | -12 | -1.58 | -0.375 |
| -0.519999999999997 | -12 | -1.58 | -0.375 |
| -0.515999999999997 | -12 | -1.58 | -0.375 |
| -0.511999999999997 | -12 | -1.58 | -0.375 |
| -0.507999999999997 | -12 | -1.58 | -0.375 |
| -0.503999999999997 | -12 | -1.58 | -0.375 |
| -0.499999999999997 | -12 | -1.58 | -0.375 |
| -0.495999999999997 | -12 | -1.58 | -0.375 |
| -0.491999999999997 | -12 | -1.58 | -0.375 |
| -0.487999999999997 | -12 | -1.58 | -0.375 |
| -0.483999999999997 | -12 | -1.58 | -0.375 |
| -0.479999999999997 | -12 | -1.58 | -0.375 |
| -0.475999999999997 | -12 | -1.58 | -0.375 |
| -0.471999999999997 | -12 | -1.58 | -0.375 |
| -0.467999999999997 | -12 | -1.58 | -0.375 |
| -0.463999999999997 | -12 | -1.58 | -0.375 |
| -0.459999999999997 | -12 | -1.58 | -0.375 |
| -0.455999999999997 | -12 | -1.58 | -0.375 |
| -0.451999999999997 | -12 | -1.58 | -0.375 |
| -0.447999999999997 | -12 | -1.58 | -0.375 |
| -0.443999999999997 | -12 | -1.58 | -0.375 |
| -0.439999999999997 | -12 | -1.58 | -0.375 |
| -0.435999999999997 | -12 | -1.58 | -0.375 |
| -0.431999999999997 | -12 | -1.58 | -0.375 |
| -0.427999999999997 | -12 | -1.58 | -0.375 |
| -0.423999999999997 | -12 | -1.58 | -0.375 |
| -0.419999999999997 | -12 | -1.58 | -0.375 |
| -0.415999999999997 | -12 | -1.58 | -0.375 |
| -0.411999999999997 | -12 | -1.58 | -0.375 |
| -0.407999999999997 | -12 | -1.58 | -0.375 |
| -0.403999999999997 | -12 | -1.58 | -0.375 |
| -0.399999999999997 | -12 | -1.58 | -0.375 |
| -0.395999999999997 | -12 | -1.58 | -0.375 |
| -0.391999999999997 | -12 | -1.58 | -0.375 |
| -0.387999999999997 | -12 | -1.58 | -0.375 |
| -0.383999999999997 | -12 | -1.58 | -0.375 |
| -0.379999999999997 | -12 | -1.58 | -0.375 |
| -0.375999999999997 | -12 | -1.58 | -0.375 |
| -0.371999999999997 | -12 | -1.58 | -0.375 |
| -0.367999999999997 | -12 | -1.58 | -0.375 |
| -0.363999999999997 | -12 | -1.58 | -0.375 |
| -0.359999999999997 | -12 | -1.58 | -0.375 |
| -0.355999999999997 | -12 | -1.58 | -0.375 |
| -0.351999999999997 | -12 | -1.58 | -0.375 |
| -0.347999999999997 | -12 | -1.58 | -0.375 |
| -0.343999999999997 | -12 | -1.58 | -0.375 |
| -0.339999999999997 | -12 | -1.58 | -0.375 |
| -0.335999999999997 | -12 | -1.58 | -0.375 |
| -0.331999999999997 | -12 | -1.58 | -0.375 |
| -0.327999999999997 | -12 | -1.58 | -0.375 |
| -0.323999999999997 | -12 | -1.58 | -0.375 |
| -0.319999999999997 | -12 | -1.58 | -0.375 |
| -0.315999999999997 | -12 | -1.58 | -0.375 |
| -0.311999999999997 | -12 | -1.58 | -0.375 |
| -0.307999999999997 | -12 | -1.58 | -0.375 |
| -0.303999999999997 | -12 | -1.58 | -0.375 |
| -0.299999999999997 | -12 | -1.58 | -0.375 |
| -0.295999999999997 | -12 | -1.58 | -0.375 |
| -0.291999999999997 | -12 | -1.58 | -0.375 |
| -0.287999999999997 | -12 | -1.58 | -0.375 |
| -0.283999999999997 | -12 | -1.58 | -0.375 |
| -0.279999999999997 | -12 | -1.58 | -0.375 |
| -0.275999999999997 | -12 | -1.58 | -0.375 |
| -0.271999999999997 | -12 | -1.58 | -0.375 |
| -0.267999999999997 | -12 | -1.58 | -0.375 |
| -0.263999999999997 | -12 | -1.58 | -0.375 |
| -0.259999999999997 | -12 | -1.58 | -0.375 |
| -0.255999999999997 | -12 | -1.58 | -0.375 |
| -0.251999999999997 | -12 | -1.58 | -0.375 |
| -0.247999999999997 | -12 | -1.58 | -0.375 |
| -0.243999999999997 | -12 | -1.58 | -0.375 |
| -0.239999999999997 | -12 | -1.58 | -0.375 |
| -0.235999999999997 | -12 | -1.58 | -0.375 |
| -0.231999999999997 | -12 | -1.58 | -0.375 |
| -0.227999999999997 | -12 | -1.58 | -0.375 |
| -0.223999999999997 | -12 | -1.58 | -0.375 |
| -0.219999999999997 | -12 | -1.58 | -0.375 |
| -0.215999999999997 | -12 | -1.58 | -0.375 |
| -0.211999999999997 | -12 | -1.58 | -0.375 |
| -0.207999999999997 | -12 | -1.58 | -0.375 |
| -0.203999999999997 | -12 | -1.58 | -0.375 |
| -0.199999999999997 | -12 | -1.58 | -0.375 |
| -0.195999999999997 | -12 | -1.58 | -0.375 |
| -0.191999999999997 | -12 | -1.58 | -0.375 |
| -0.187999999999997 | -12 | -1.58 | -0.375 |
| -0.183999999999997 | -12 | -1.58 | -0.375 |
| -0.179999999999997 | -12 | -1.58 | -0.375 |
| -0.175999999999997 | -12 | -1.58 | -0.375 |
| -0.171999999999997 | -12 | -1.58 | -0.375 |
| -0.167999999999997 | -12 | -1.58 | -0.375 |
| -0.163999999999997 | -12 | -1.58 | -0.375 |
| -0.159999999999997 | -12 | -1.58 | -0.375 |
| -0.155999999999997 | -12 | -1.58 | -0.375 |
| -0.151999999999997 | -12 | -1.58 | -0.375 |
| -0.147999999999997 | -12 | -1.58 | -0.375 |
| -0.143999999999997 | -12 | -1.58 | -0.375 |
| -0.139999999999997 | -12 | -1.58 | -0.375 |
| -0.135999999999997 | -12 | -1.58 | -0.375 |
| -0.131999999999997 | -12 | -1.58 | -0.375 |
| -0.127999999999997 | -12 | -1.58 | -0.375 |
| -0.123999999999997 | -12 | -1.58 | -0.375 |
| -0.119999999999997 | -12 | -1.58 | -0.375 |
| -0.115999999999997 | -12 | -1.58 | -0.375 |
| -0.111999999999997 | -12 | -1.58 | -0.375 |
| -0.107999999999997 | -12 | -1.58 | -0.375 |
| -0.103999999999997 | -12 | -1.58 | -0.375 |
| -0.0999999999999965 | -12 | -1.58 | -0.375 |
| -0.0959999999999965 | -12 | -1.58 | -0.375 |
| -0.0919999999999965 | -12 | -1.58 | -0.375 |
| -0.0879999999999965 | -12 | -1.58 | -0.375 |
| -0.0839999999999965 | -12 | -1.58 | -0.375 |
| -0.0799999999999965 | -12 | -1.58 | -0.375 |
| -0.0759999999999965 | -12 | -1.58 | -0.375 |
| -0.0719999999999965 | -12 | -1.58 | -0.375 |
| -0.0679999999999965 | -12 | -1.58 | -0.375 |
| -0.0639999999999965 | -12 | -1.58 | -0.375 |
| -0.0599999999999965 | -12 | -1.58 | -0.375 |
| -0.0559999999999965 | -12 | -1.58 | -0.375 |
| -0.0519999999999965 | -12 | -1.58 | -0.375 |
| -0.0479999999999965 | -12 | -1.58 | -0.375 |
| -0.0439999999999965 | -12 | -1.58 | -0.375 |
| -0.0399999999999965 | -12 | -1.58 | -0.375 |
| -0.0359999999999965 | -12 | -1.58 | -0.375 |
| -0.0319999999999965 | -12 | -1.58 | -0.375 |
| -0.0279999999999965 | -12 | -1.58 | -0.375 |
| -0.0239999999999965 | -12 | -1.58 | -0.375 |
| -0.0199999999999965 | -12 | -1.58 | -0.375 |
| -0.0159999999999965 | -12 | -1.58 | -0.375 |
| -0.0119999999999965 | -12 | -1.58 | -0.375 |
| -0.00799999999999647 | -12 | -1.58 | -0.375 |
| -0.00399999999999647 | -12 | -1.58 | -0.375 |
| 3.52495810318487e-15 | -12 | -1.58 | -0.375 |
| 0.00400000000000352 | -12 | -1.58 | -0.375 |
| 0.00800000000000352 | -12 | -1.58 | -0.375 |
| 0.0120000000000035 | -12 | -1.58 | -0.375 |
| 0.0160000000000035 | -12 | -1.58 | -0.375 |
| 0.0200000000000035 | -12 | -1.58 | -0.375 |
| 0.0240000000000035 | -12 | -1.58 | -0.375 |
| 0.0280000000000035 | -12 | -1.58 | -0.375 |
| 0.0320000000000035 | -12 | -1.58 | -0.375 |
| 0.0360000000000035 | -12 | -1.58 | -0.375 |
| 0.0400000000000035 | -12 | -1.58 | -0.375 |
| 0.0440000000000035 | -12 | -1.58 | -0.375 |
| 0.0480000000000035 | -12 | -1.58 | -0.375 |
| 0.0520000000000035 | -12 | -1.58 | -0.375 |
| 0.0560000000000035 | -12 | -1.58 | -0.375 |
| 0.0600000000000035 | -12 | -1.58 | -0.375 |
| 0.0640000000000035 | -12 | -1.58 | -0.375 |
| 0.0680000000000035 | -12 | -1.58 | -0.375 |
| 0.0720000000000036 | -12 | -1.58 | -0.375 |
| 0.0760000000000036 | -12 | -1.58 | -0.375 |
| 0.0800000000000036 | -12 | -1.58 | -0.375 |
| 0.0840000000000036 | -12 | -1.58 | -0.375 |
| 0.0880000000000036 | -12 | -1.58 | -0.375 |
| 0.0920000000000036 | -12 | -1.58 | -0.375 |
| 0.0960000000000036 | -12 | -1.58 | -0.375 |
| 0.100000000000004 | -12 | -1.58 | -0.375 |
| 0.104000000000004 | -12 | -1.58 | -0.375 |
| 0.108000000000004 | -12 | -1.58 | -0.375 |
| 0.112000000000004 | -12 | -1.58 | -0.375 |
| 0.116000000000004 | -12 | -1.58 | -0.375 |
| 0.120000000000004 | -12 | -1.58 | -0.375 |
| 0.124000000000004 | -12 | -1.58 | -0.375 |
| 0.128000000000004 | -12 | -1.58 | -0.375 |
| 0.132000000000004 | -12 | -1.58 | -0.375 |
| 0.136000000000004 | -12 | -1.58 | -0.375 |
| 0.140000000000004 | -12 | -1.58 | -0.375 |
| 0.144000000000004 | -12 | -1.58 | -0.375 |
| 0.148000000000004 | -12 | -1.58 | -0.375 |
| 0.152000000000004 | -12 | -1.58 | -0.375 |
| 0.156000000000004 | -12 | -1.58 | -0.375 |
| 0.160000000000004 | -12 | -1.58 | -0.375 |
| 0.164000000000004 | -12 | -1.58 | -0.375 |
| 0.168000000000004 | -12 | -1.58 | -0.375 |
| 0.172000000000004 | -12 | -1.58 | -0.375 |
| 0.176000000000004 | -12 | -1.58 | -0.375 |
| 0.180000000000004 | -12 | -1.58 | -0.375 |
| 0.184000000000004 | -12 | -1.58 | -0.375 |
| 0.188000000000004 | -12 | -1.58 | -0.375 |
| 0.192000000000004 | -12 | -1.58 | -0.375 |
| 0.196000000000004 | -12 | -1.58 | -0.375 |
| 0.200000000000004 | -12 | -1.58 | -0.375 |
| 0.204000000000004 | -12 | -1.58 | -0.375 |
| 0.208000000000004 | -12 | -1.58 | -0.375 |
| 0.212000000000004 | -12 | -1.58 | -0.375 |
| 0.216000000000004 | -12 | -1.58 | -0.375 |
| 0.220000000000004 | -12 | -1.58 | -0.375 |
| 0.224000000000004 | -12 | -1.58 | -0.375 |
| 0.228000000000004 | -12 | -1.58 | -0.375 |
| 0.232000000000004 | -12 | -1.58 | -0.375 |
| 0.236000000000004 | -12 | -1.58 | -0.375 |
| 0.240000000000004 | -12 | -1.58 | -0.375 |
| 0.244000000000004 | -12 | -1.58 | -0.375 |
| 0.248000000000004 | -12 | -1.58 | -0.375 |
| 0.252000000000004 | -12 | -1.58 | -0.375 |
| 0.256000000000004 | -12 | -1.58 | -0.375 |
| 0.260000000000004 | -12 | -1.58 | -0.375 |
| 0.264000000000004 | -12 | -1.58 | -0.375 |
| 0.268000000000004 | -12 | -1.58 | -0.375 |
| 0.272000000000004 | -12 | -1.58 | -0.375 |
| 0.276000000000004 | -12 | -1.58 | -0.375 |
| 0.280000000000004 | -12 | -1.58 | -0.375 |
| 0.284000000000004 | -12 | -1.58 | -0.375 |
| 0.288000000000004 | -12 | -1.58 | -0.375 |
| 0.292000000000004 | -12 | -1.58 | -0.375 |
| 0.296000000000004 | -12 | -1.58 | -0.375 |
| 0.300000000000004 | -12 | -1.58 | -0.375 |
| 0.304000000000004 | -12 | -1.58 | -0.375 |
| 0.308000000000004 | -12 | -1.58 | -0.375 |
| 0.312000000000004 | -12 | -1.58 | -0.375 |
| 0.316000000000004 | -12 | -1.58 | -0.375 |
| 0.320000000000004 | -12 | -1.58 | -0.375 |
| 0.324000000000004 | -12 | -1.58 | -0.375 |
| 0.328000000000004 | -12 | -1.58 | -0.375 |
| 0.332000000000004 | -12 | -1.58 | -0.375 |
| 0.336000000000004 | -12 | -1.58 | -0.375 |
| 0.340000000000004 | -12 | -1.58 | -0.375 |
| 0.344000000000004 | -12 | -1.58 | -0.375 |
| 0.348000000000004 | -12 | -1.58 | -0.375 |
| 0.352000000000004 | -12 | -1.58 | -0.375 |
| 0.356000000000004 | -12 | -1.58 | -0.375 |
| 0.360000000000004 | -12 | -1.58 | -0.375 |
| 0.364000000000004 | -12 | -1.58 | -0.375 |
| 0.368000000000004 | -12 | -1.58 | -0.375 |
| 0.372000000000004 | -12 | -1.58 | -0.375 |
| 0.376000000000004 | -12 | -1.58 | -0.375 |
| 0.380000000000004 | -12 | -1.58 | -0.375 |
| 0.384000000000004 | -12 | -1.58 | -0.375 |
| 0.388000000000004 | -12 | -1.58 | -0.375 |
| 0.392000000000004 | -12 | -1.58 | -0.375 |
| 0.396000000000004 | -12 | -1.58 | -0.375 |
| 0.400000000000004 | -12 | -1.58 | -0.375 |
| 0.404000000000004 | -12 | -1.58 | -0.375 |
| 0.408000000000004 | -12 | -1.58 | -0.375 |
| 0.412000000000004 | -12 | -1.58 | -0.375 |
| 0.416000000000004 | -12 | -1.58 | -0.375 |
| 0.420000000000004 | -12 | -1.58 | -0.375 |
| 0.424000000000004 | -12 | -1.58 | -0.375 |
| 0.428000000000004 | -12 | -1.58 | -0.375 |
| 0.432000000000004 | -12 | -1.58 | -0.375 |
| 0.436000000000004 | -12 | -1.58 | -0.375 |
| 0.440000000000004 | -12 | -1.58 | -0.375 |
| 0.444000000000004 | -12 | -1.58 | -0.375 |
| 0.448000000000004 | -12 | -1.58 | -0.375 |
| 0.452000000000004 | -12 | -1.58 | -0.375 |
| 0.456000000000004 | -12 | -1.58 | -0.375 |
| 0.460000000000004 | -12 | -1.58 | -0.375 |
| 0.464000000000004 | -12 | -1.58 | -0.375 |
| 0.468000000000004 | -12 | -1.58 | -0.375 |
| 0.472000000000004 | -12 | -1.58 | -0.375 |
| 0.476000000000004 | -12 | -1.58 | -0.375 |
| 0.480000000000004 | -12 | -1.58 | -0.375 |
| 0.484000000000004 | -12 | -1.58 | -0.375 |
| 0.488000000000004 | -12 | -1.58 | -0.375 |
| 0.492000000000004 | -12 | -1.58 | -0.375 |
| 0.496000000000004 | -12 | -1.58 | -0.375 |
| 0.500000000000004 | -12 | -1.58 | -0.375 |
| 0.504000000000004 | -12 | -1.58 | -0.375 |
| 0.508000000000004 | -12 | -1.58 | -0.375 |
| 0.512000000000004 | -12 | -1.58 | -0.375 |
| 0.516000000000004 | -12 | -1.58 | -0.375 |
| 0.520000000000004 | -12 | -1.58 | -0.375 |
| 0.524000000000004 | -12 | -1.58 | -0.375 |
| 0.528000000000004 | -12 | -1.58 | -0.375 |
| 0.532000000000004 | -12 | -1.58 | -0.375 |
| 0.536000000000004 | -12 | -1.58 | -0.375 |
| 0.540000000000004 | -12 | -1.58 | -0.375 |
| 0.544000000000004 | -12 | -1.58 | -0.375 |
| 0.548000000000004 | -12 | -1.58 | -0.375 |
| 0.552000000000004 | -12 | -1.58 | -0.375 |
| 0.556000000000004 | -12 | -1.58 | -0.375 |
| 0.560000000000004 | -12 | -1.58 | -0.375 |
| 0.564000000000004 | -12 | -1.58 | -0.375 |
| 0.568000000000004 | -12 | -1.58 | -0.375 |
| 0.572000000000004 | -12 | -1.58 | -0.375 |
| 0.576000000000004 | -12 | -1.58 | -0.375 |
| 0.580000000000004 | -12 | -1.58 | -0.375 |
| 0.584000000000004 | -12 | -1.58 | -0.375 |
| 0.588000000000004 | -12 | -1.58 | -0.375 |
| 0.592000000000004 | -12 | -1.58 | -0.375 |
| 0.596000000000004 | -12 | -1.58 | -0.375 |
| 0.600000000000004 | -12 | -1.58 | -0.375 |
| 0.604000000000004 | -12 | -1.58 | -0.375 |
| 0.608000000000004 | -11.999 | -1.58 | -0.375 |
| 0.612000000000004 | -11.999 | -1.58 | -0.375 |
| 0.616000000000004 | -11.999 | -1.58 | -0.375 |
| 0.620000000000004 | -11.999 | -1.58 | -0.375 |
| 0.624000000000004 | -11.999 | -1.58 | -0.375 |
| 0.628000000000004 | -11.999 | -1.58 | -0.375 |
| 0.632000000000004 | -11.999 | -1.58 | -0.374 |
| 0.636000000000004 | -11.999 | -1.58 | -0.374 |
| 0.640000000000004 | -11.999 | -1.58 | -0.374 |
| 0.644000000000004 | -11.999 | -1.58 | -0.374 |
| 0.648000000000004 | -11.999 | -1.579 | -0.374 |
| 0.652000000000004 | -11.999 | -1.579 | -0.374 |
| 0.656000000000004 | -11.999 | -1.579 | -0.374 |
| 0.660000000000004 | -11.999 | -1.579 | -0.374 |
| 0.664000000000004 | -11.999 | -1.579 | -0.374 |
| 0.668000000000004 | -11.999 | -1.579 | -0.374 |
| 0.672000000000004 | -11.999 | -1.579 | -0.374 |
| 0.676000000000004 | -11.999 | -1.579 | -0.374 |
| 0.680000000000004 | -11.999 | -1.579 | -0.374 |
| 0.684000000000004 | -11.998 | -1.579 | -0.374 |
| 0.688000000000004 | -11.998 | -1.579 | -0.374 |
| 0.692000000000004 | -11.998 | -1.579 | -0.374 |
| 0.696000000000004 | -11.998 | -1.579 | -0.374 |
| 0.700000000000004 | -11.998 | -1.579 | -0.374 |
| 0.704000000000004 | -11.998 | -1.579 | -0.374 |
| 0.708000000000004 | -11.998 | -1.579 | -0.374 |
| 0.712000000000004 | -11.998 | -1.578 | -0.374 |
| 0.716000000000004 | -11.998 | -1.578 | -0.373 |
| 0.720000000000004 | -11.998 | -1.578 | -0.373 |
| 0.724000000000004 | -11.997 | -1.578 | -0.373 |
| 0.728000000000004 | -11.997 | -1.578 | -0.373 |
| 0.732000000000004 | -11.997 | -1.578 | -0.373 |
| 0.736000000000004 | -11.997 | -1.578 | -0.373 |
| 0.740000000000004 | -11.997 | -1.578 | -0.373 |
| 0.744000000000004 | -11.997 | -1.578 | -0.373 |
| 0.748000000000004 | -11.997 | -1.578 | -0.373 |
| 0.752000000000004 | -11.996 | -1.577 | -0.373 |
| 0.756000000000004 | -11.996 | -1.577 | -0.373 |
| 0.760000000000004 | -11.996 | -1.577 | -0.373 |
| 0.764000000000004 | -11.996 | -1.577 | -0.372 |
| 0.768000000000004 | -11.996 | -1.577 | -0.372 |
| 0.772000000000004 | -11.995 | -1.577 | -0.372 |
| 0.776000000000004 | -11.995 | -1.576 | -0.372 |
| 0.780000000000004 | -11.995 | -1.576 | -0.372 |
| 0.784000000000004 | -11.995 | -1.576 | -0.372 |
| 0.788000000000004 | -11.994 | -1.576 | -0.372 |
| 0.792000000000004 | -11.994 | -1.576 | -0.372 |
| 0.796000000000004 | -11.994 | -1.576 | -0.371 |
| 0.800000000000004 | -11.994 | -1.575 | -0.371 |
| 0.804000000000004 | -11.993 | -1.575 | -0.371 |
| 0.808000000000004 | -11.993 | -1.575 | -0.371 |
| 0.812000000000004 | -11.993 | -1.575 | -0.371 |
| 0.816000000000004 | -11.992 | -1.574 | -0.371 |
| 0.820000000000004 | -11.992 | -1.574 | -0.37 |
| 0.824000000000004 | -11.992 | -1.574 | -0.37 |
| 0.828000000000004 | -11.991 | -1.574 | -0.37 |
| 0.832000000000004 | -11.991 | -1.573 | -0.37 |
| 0.836000000000004 | -11.991 | -1.573 | -0.37 |
| 0.840000000000004 | -11.99 | -1.573 | -0.369 |
| 0.844000000000004 | -11.99 | -1.573 | -0.369 |
| 0.848000000000004 | -11.989 | -1.572 | -0.369 |
| 0.852000000000004 | -11.989 | -1.572 | -0.369 |
| 0.856000000000004 | -11.988 | -1.572 | -0.369 |
| 0.860000000000004 | -11.988 | -1.571 | -0.368 |
| 0.864000000000004 | -11.987 | -1.571 | -0.368 |
| 0.868000000000004 | -11.987 | -1.571 | -0.368 |
| 0.872000000000004 | -11.986 | -1.57 | -0.368 |
| 0.876000000000004 | -11.986 | -1.57 | -0.367 |
| 0.880000000000004 | -11.985 | -1.57 | -0.367 |
| 0.884000000000004 | -11.985 | -1.569 | -0.367 |
| 0.888000000000004 | -11.984 | -1.569 | -0.367 |
| 0.892000000000004 | -11.983 | -1.568 | -0.366 |
| 0.896000000000004 | -11.983 | -1.568 | -0.366 |
| 0.900000000000004 | -11.982 | -1.567 | -0.366 |
| 0.904000000000004 | -11.981 | -1.567 | -0.365 |
| 0.908000000000004 | -11.981 | -1.566 | -0.365 |
| 0.912000000000004 | -11.98 | -1.566 | -0.365 |
| 0.916000000000004 | -11.979 | -1.565 | -0.364 |
| 0.920000000000004 | -11.978 | -1.565 | -0.364 |
| 0.924000000000004 | -11.978 | -1.564 | -0.364 |
| 0.928000000000004 | -11.977 | -1.564 | -0.363 |
| 0.932000000000004 | -11.976 | -1.563 | -0.363 |
| 0.936000000000004 | -11.975 | -1.563 | -0.363 |
| 0.940000000000004 | -11.974 | -1.562 | -0.362 |
| 0.944000000000004 | -11.973 | -1.561 | -0.362 |
| 0.948000000000004 | -11.972 | -1.561 | -0.361 |
| 0.952000000000004 | -11.971 | -1.56 | -0.361 |
| 0.956000000000004 | -11.97 | -1.559 | -0.361 |
| 0.960000000000004 | -11.969 | -1.559 | -0.36 |
| 0.964000000000004 | -11.968 | -1.558 | -0.36 |
| 0.968000000000004 | -11.967 | -1.557 | -0.359 |
| 0.972000000000004 | -11.965 | -1.557 | -0.359 |
| 0.976000000000004 | -11.964 | -1.556 | -0.358 |
| 0.980000000000004 | -11.963 | -1.555 | -0.358 |
| 0.984000000000004 | -11.962 | -1.554 | -0.357 |
| 0.988000000000004 | -11.96 | -1.553 | -0.357 |
| 0.992000000000004 | -11.959 | -1.553 | -0.356 |
| 0.996000000000004 | -11.958 | -1.552 | -0.356 |
| 1.000000000000004 | -11.956 | -1.551 | -0.355 |
| 1.004000000000004 | -11.955 | -1.55 | -0.355 |
| 1.008000000000004 | -11.953 | -1.549 | -0.354 |
| 1.012000000000004 | -11.951 | -1.548 | -0.354 |
| 1.016000000000004 | -11.95 | -1.547 | -0.353 |
| 1.020000000000004 | -11.948 | -1.546 | -0.352 |
| 1.024000000000004 | -11.946 | -1.545 | -0.352 |
| 1.028000000000004 | -11.945 | -1.544 | -0.351 |
| 1.032000000000004 | -11.943 | -1.543 | -0.351 |
| 1.036000000000004 | -11.941 | -1.542 | -0.35 |
| 1.040000000000004 | -11.939 | -1.541 | -0.349 |
| 1.044000000000004 | -11.937 | -1.54 | -0.349 |
| 1.048000000000004 | -11.935 | -1.539 | -0.348 |
| 1.052000000000004 | -11.933 | -1.537 | -0.347 |
| 1.056000000000004 | -11.931 | -1.536 | -0.347 |
| 1.060000000000004 | -11.929 | -1.535 | -0.346 |
| 1.064000000000004 | -11.927 | -1.534 | -0.345 |
| 1.068000000000004 | -11.924 | -1.532 | -0.344 |
| 1.072000000000004 | -11.922 | -1.531 | -0.344 |
| 1.076000000000004 | -11.92 | -1.53 | -0.343 |
| 1.080000000000004 | -11.917 | -1.528 | -0.342 |
| 1.084000000000004 | -11.915 | -1.527 | -0.341 |
| 1.088000000000004 | -11.912 | -1.525 | -0.341 |
| 1.092000000000004 | -11.909 | -1.524 | -0.34 |
| 1.096000000000004 | -11.907 | -1.523 | -0.339 |
| 1.100000000000004 | -11.904 | -1.521 | -0.338 |
| 1.104000000000004 | -11.901 | -1.519 | -0.337 |
| 1.108000000000004 | -11.898 | -1.518 | -0.336 |
| 1.112000000000004 | -11.895 | -1.516 | -0.336 |
| 1.116000000000004 | -11.892 | -1.515 | -0.335 |
| 1.120000000000004 | -11.889 | -1.513 | -0.334 |
| 1.124000000000004 | -11.886 | -1.511 | -0.333 |
| 1.128000000000004 | -11.882 | -1.509 | -0.332 |
| 1.132000000000004 | -11.879 | -1.508 | -0.331 |
| 1.136000000000004 | -11.876 | -1.506 | -0.33 |
| 1.140000000000004 | -11.872 | -1.504 | -0.329 |
| 1.144000000000004 | -11.869 | -1.502 | -0.328 |
| 1.148000000000004 | -11.865 | -1.5 | -0.327 |
| 1.152000000000004 | -11.861 | -1.498 | -0.326 |
| 1.156000000000004 | -11.857 | -1.496 | -0.325 |
| 1.160000000000004 | -11.853 | -1.494 | -0.324 |
| 1.164000000000004 | -11.849 | -1.492 | -0.323 |
| 1.168000000000004 | -11.845 | -1.49 | -0.322 |
| 1.172000000000004 | -11.841 | -1.488 | -0.321 |
| 1.176000000000004 | -11.837 | -1.486 | -0.32 |
| 1.180000000000004 | -11.833 | -1.484 | -0.319 |
| 1.184000000000004 | -11.828 | -1.482 | -0.318 |
| 1.188000000000004 | -11.824 | -1.479 | -0.317 |
| 1.192000000000004 | -11.819 | -1.477 | -0.315 |
| 1.196000000000004 | -11.814 | -1.475 | -0.314 |
| 1.200000000000004 | -11.809 | -1.472 | -0.313 |
| 1.204000000000004 | -11.804 | -1.47 | -0.312 |
| 1.208000000000004 | -11.799 | -1.468 | -0.311 |
| 1.212000000000004 | -11.794 | -1.465 | -0.31 |
| 1.216000000000004 | -11.789 | -1.463 | -0.308 |
| 1.220000000000004 | -11.784 | -1.46 | -0.307 |
| 1.224000000000004 | -11.778 | -1.457 | -0.306 |
| 1.228000000000004 | -11.773 | -1.455 | -0.305 |
| 1.232000000000004 | -11.767 | -1.452 | -0.303 |
| 1.236000000000004 | -11.761 | -1.449 | -0.302 |
| 1.240000000000004 | -11.755 | -1.447 | -0.301 |
| 1.244000000000004 | -11.749 | -1.444 | -0.3 |
| 1.248000000000004 | -11.743 | -1.441 | -0.298 |
| 1.252000000000004 | -11.737 | -1.438 | -0.297 |
| 1.256000000000004 | -11.73 | -1.435 | -0.296 |
| 1.260000000000004 | -11.724 | -1.432 | -0.294 |
| 1.264000000000004 | -11.717 | -1.429 | -0.293 |
| 1.268000000000004 | -11.711 | -1.426 | -0.292 |
| 1.272000000000004 | -11.704 | -1.423 | -0.29 |
| 1.276000000000004 | -11.697 | -1.42 | -0.289 |
| 1.280000000000004 | -11.69 | -1.417 | -0.288 |
| 1.284000000000004 | -11.682 | -1.414 | -0.286 |
| 1.288000000000004 | -11.675 | -1.411 | -0.285 |
| 1.292000000000004 | -11.668 | -1.407 | -0.283 |
| 1.296000000000004 | -11.66 | -1.404 | -0.282 |
| 1.300000000000004 | -11.652 | -1.401 | -0.28 |
| 1.304000000000004 | -11.644 | -1.397 | -0.279 |
| 1.308000000000004 | -11.636 | -1.394 | -0.278 |
| 1.312000000000004 | -11.628 | -1.391 | -0.276 |
| 1.316000000000004 | -11.62 | -1.387 | -0.275 |
| 1.320000000000004 | -11.611 | -1.383 | -0.273 |
| 1.324000000000004 | -11.603 | -1.38 | -0.272 |
| 1.328000000000004 | -11.594 | -1.376 | -0.27 |
| 1.332000000000004 | -11.585 | -1.373 | -0.269 |
| 1.336000000000004 | -11.576 | -1.369 | -0.267 |
| 1.340000000000004 | -11.567 | -1.365 | -0.266 |
| 1.344000000000004 | -11.558 | -1.361 | -0.264 |
| 1.348000000000004 | -11.548 | -1.358 | -0.262 |
| 1.352000000000004 | -11.538 | -1.354 | -0.261 |
| 1.356000000000004 | -11.529 | -1.35 | -0.259 |
| 1.360000000000004 | -11.519 | -1.346 | -0.258 |
| 1.364000000000004 | -11.509 | -1.342 | -0.256 |
| 1.368000000000004 | -11.498 | -1.338 | -0.255 |
| 1.372000000000004 | -11.488 | -1.334 | -0.253 |
| 1.376000000000004 | -11.477 | -1.33 | -0.251 |
| 1.380000000000004 | -11.467 | -1.325 | -0.25 |
| 1.384000000000004 | -11.456 | -1.321 | -0.248 |
| 1.388000000000005 | -11.445 | -1.317 | -0.247 |
| 1.392000000000004 | -11.434 | -1.313 | -0.245 |
| 1.396000000000004 | -11.422 | -1.308 | -0.243 |
| 1.400000000000005 | -11.411 | -1.304 | -0.242 |
| 1.404000000000005 | -11.399 | -1.3 | -0.24 |
| 1.408000000000005 | -11.387 | -1.295 | -0.238 |
| 1.412000000000005 | -11.375 | -1.291 | -0.237 |
| 1.416000000000005 | -11.363 | -1.286 | -0.235 |
| 1.420000000000005 | -11.35 | -1.282 | -0.233 |
| 1.424000000000005 | -11.338 | -1.277 | -0.232 |
| 1.428000000000005 | -11.325 | -1.273 | -0.23 |
| 1.432000000000005 | -11.312 | -1.268 | -0.228 |
| 1.436000000000005 | -11.299 | -1.263 | -0.227 |
| 1.440000000000005 | -11.286 | -1.258 | -0.225 |
| 1.444000000000005 | -11.272 | -1.254 | -0.223 |
| 1.448000000000005 | -11.258 | -1.249 | -0.222 |
| 1.452000000000005 | -11.245 | -1.244 | -0.22 |
| 1.456000000000005 | -11.231 | -1.239 | -0.218 |
| 1.460000000000005 | -11.216 | -1.234 | -0.217 |
| 1.464000000000005 | -11.202 | -1.229 | -0.215 |
| 1.468000000000005 | -11.187 | -1.224 | -0.213 |
| 1.472000000000005 | -11.173 | -1.219 | -0.211 |
| 1.476000000000005 | -11.158 | -1.214 | -0.21 |
| 1.480000000000005 | -11.142 | -1.209 | -0.208 |
| 1.484000000000005 | -11.127 | -1.204 | -0.206 |
| 1.488000000000005 | -11.112 | -1.199 | -0.205 |
| 1.492000000000005 | -11.096 | -1.194 | -0.203 |
| 1.496000000000005 | -11.08 | -1.189 | -0.201 |
| 1.500000000000005 | -11.064 | -1.183 | -0.2 |
| 1.504000000000005 | -11.048 | -1.178 | -0.198 |
| 1.508000000000005 | -11.031 | -1.173 | -0.196 |
| 1.512000000000005 | -11.014 | -1.167 | -0.194 |
| 1.516000000000005 | -10.997 | -1.162 | -0.193 |
| 1.520000000000005 | -10.98 | -1.157 | -0.191 |
| 1.524000000000005 | -10.963 | -1.151 | -0.189 |
| 1.528000000000005 | -10.946 | -1.146 | -0.188 |
| 1.532000000000005 | -10.928 | -1.14 | -0.186 |
| 1.536000000000005 | -10.91 | -1.135 | -0.184 |
| 1.540000000000005 | -10.892 | -1.129 | -0.182 |
| 1.544000000000005 | -10.874 | -1.124 | -0.181 |
| 1.548000000000005 | -10.855 | -1.118 | -0.179 |
| 1.552000000000005 | -10.836 | -1.112 | -0.177 |
| 1.556000000000005 | -10.818 | -1.107 | -0.176 |
| 1.560000000000005 | -10.798 | -1.101 | -0.174 |
| 1.564000000000005 | -10.779 | -1.095 | -0.172 |
| 1.568000000000005 | -10.76 | -1.09 | -0.171 |
| 1.572000000000005 | -10.74 | -1.084 | -0.169 |
| 1.576000000000005 | -10.72 | -1.078 | -0.167 |
| 1.580000000000005 | -10.7 | -1.072 | -0.166 |
| 1.584000000000005 | -10.68 | -1.067 | -0.164 |
| 1.588000000000005 | -10.659 | -1.061 | -0.162 |
| 1.592000000000005 | -10.638 | -1.055 | -0.161 |
| 1.596000000000005 | -10.617 | -1.049 | -0.159 |
| 1.600000000000005 | -10.596 | -1.043 | -0.157 |
| 1.604000000000005 | -10.575 | -1.037 | -0.156 |
| 1.608000000000005 | -10.553 | -1.031 | -0.154 |
| 1.612000000000005 | -10.532 | -1.025 | -0.152 |
| 1.616000000000005 | -10.51 | -1.019 | -0.151 |
| 1.620000000000005 | -10.487 | -1.013 | -0.149 |
| 1.624000000000005 | -10.465 | -1.007 | -0.148 |
| 1.628000000000005 | -10.442 | -1.001 | -0.146 |
| 1.632000000000005 | -10.42 | -0.995 | -0.144 |
| 1.636000000000005 | -10.397 | -0.989 | -0.143 |
| 1.640000000000005 | -10.373 | -0.983 | -0.141 |
| 1.644000000000005 | -10.35 | -0.977 | -0.14 |
| 1.648000000000005 | -10.326 | -0.971 | -0.138 |
| 1.652000000000005 | -10.303 | -0.965 | -0.137 |
| 1.656000000000005 | -10.279 | -0.959 | -0.135 |
| 1.660000000000005 | -10.254 | -0.953 | -0.133 |
| 1.664000000000005 | -10.23 | -0.946 | -0.132 |
| 1.668000000000005 | -10.205 | -0.94 | -0.13 |
| 1.672000000000005 | -10.18 | -0.934 | -0.129 |
| 1.676000000000005 | -10.155 | -0.928 | -0.127 |
| 1.680000000000005 | -10.13 | -0.922 | -0.126 |
| 1.684000000000005 | -10.105 | -0.916 | -0.124 |
| 1.688000000000005 | -10.079 | -0.909 | -0.123 |
| 1.692000000000005 | -10.053 | -0.903 | -0.121 |
| 1.696000000000005 | -10.027 | -0.897 | -0.12 |
| 1.700000000000005 | -10.001 | -0.891 | -0.118 |
| 1.704000000000005 | -9.974 | -0.885 | -0.117 |
| 1.708000000000005 | -9.948 | -0.878 | -0.115 |
| 1.712000000000005 | -9.921 | -0.872 | -0.114 |
| 1.716000000000005 | -9.894 | -0.866 | -0.113 |
| 1.720000000000005 | -9.866 | -0.86 | -0.111 |
| 1.724000000000005 | -9.839 | -0.853 | -0.11 |
| 1.728000000000005 | -9.811 | -0.847 | -0.108 |
| 1.732000000000005 | -9.784 | -0.841 | -0.107 |
| 1.736000000000005 | -9.755 | -0.835 | -0.106 |
| 1.740000000000005 | -9.727 | -0.828 | -0.104 |
| 1.744000000000005 | -9.699 | -0.822 | -0.103 |
| 1.748000000000005 | -9.67 | -0.816 | -0.101 |
| 1.752000000000005 | -9.641 | -0.81 | -0.1 |
| 1.756000000000005 | -9.612 | -0.804 | -0.099 |
| 1.760000000000005 | -9.583 | -0.797 | -0.097 |
| 1.764000000000005 | -9.554 | -0.791 | -0.096 |
| 1.768000000000005 | -9.524 | -0.785 | -0.095 |
| 1.772000000000005 | -9.495 | -0.779 | -0.093 |
| 1.776000000000005 | -9.465 | -0.772 | -0.092 |
| 1.780000000000005 | -9.435 | -0.766 | -0.091 |
| 1.784000000000005 | -9.404 | -0.76 | -0.09 |
| 1.788000000000005 | -9.374 | -0.754 | -0.088 |
| 1.792000000000005 | -9.343 | -0.748 | -0.087 |
| 1.796000000000005 | -9.312 | -0.742 | -0.086 |
| 1.800000000000005 | -9.281 | -0.735 | -0.085 |
| 1.804000000000005 | -9.25 | -0.729 | -0.084 |
| 1.808000000000005 | -9.219 | -0.723 | -0.082 |
| 1.812000000000005 | -9.187 | -0.717 | -0.081 |
| 1.816000000000005 | -9.156 | -0.711 | -0.08 |
| 1.820000000000005 | -9.124 | -0.705 | -0.079 |
| 1.824000000000005 | -9.092 | -0.699 | -0.078 |
| 1.828000000000005 | -9.06 | -0.693 | -0.076 |
| 1.832000000000005 | -9.027 | -0.687 | -0.075 |
| 1.836000000000005 | -8.995 | -0.681 | -0.074 |
| 1.840000000000005 | -8.962 | -0.675 | -0.073 |
| 1.844000000000005 | -8.929 | -0.669 | -0.072 |
| 1.848000000000005 | -8.896 | -0.663 | -0.071 |
| 1.852000000000005 | -8.863 | -0.657 | -0.07 |
| 1.856000000000005 | -8.83 | -0.651 | -0.069 |
| 1.860000000000005 | -8.797 | -0.645 | -0.068 |
| 1.864000000000005 | -8.763 | -0.639 | -0.067 |
| 1.868000000000005 | -8.729 | -0.633 | -0.066 |
| 1.872000000000005 | -8.695 | -0.627 | -0.065 |
| 1.876000000000005 | -8.661 | -0.621 | -0.064 |
| 1.880000000000005 | -8.627 | -0.615 | -0.063 |
| 1.884000000000005 | -8.593 | -0.609 | -0.062 |
| 1.888000000000005 | -8.558 | -0.603 | -0.061 |
| 1.892000000000005 | -8.524 | -0.598 | -0.06 |
| 1.896000000000005 | -8.489 | -0.592 | -0.059 |
| 1.900000000000005 | -8.454 | -0.586 | -0.058 |
| 1.904000000000005 | -8.419 | -0.58 | -0.057 |
| 1.908000000000005 | -8.384 | -0.575 | -0.056 |
| 1.912000000000005 | -8.349 | -0.569 | -0.055 |
| 1.916000000000005 | -8.314 | -0.563 | -0.054 |
| 1.920000000000005 | -8.278 | -0.558 | -0.053 |
| 1.924000000000005 | -8.243 | -0.552 | -0.052 |
| 1.928000000000005 | -8.207 | -0.547 | -0.051 |
| 1.932000000000005 | -8.171 | -0.541 | -0.05 |
| 1.936000000000005 | -8.135 | -0.535 | -0.05 |
| 1.940000000000005 | -8.099 | -0.53 | -0.049 |
| 1.944000000000005 | -8.063 | -0.524 | -0.048 |
| 1.948000000000005 | -8.026 | -0.519 | -0.047 |
| 1.952000000000005 | -7.99 | -0.513 | -0.046 |
| 1.956000000000005 | -7.954 | -0.508 | -0.046 |
| 1.960000000000005 | -7.917 | -0.503 | -0.045 |
| 1.964000000000005 | -7.88 | -0.497 | -0.044 |
| 1.968000000000005 | -7.844 | -0.492 | -0.043 |
| 1.972000000000005 | -7.807 | -0.487 | -0.042 |
| 1.976000000000005 | -7.77 | -0.481 | -0.042 |
| 1.980000000000005 | -7.733 | -0.476 | -0.041 |
| 1.984000000000005 | -7.695 | -0.471 | -0.04 |
| 1.988000000000005 | -7.658 | -0.466 | -0.039 |
| 1.992000000000005 | -7.621 | -0.461 | -0.039 |
| 1.996000000000005 | -7.584 | -0.456 | -0.038 |
| 2.000000000000005 | -7.546 | -0.45 | -0.037 |
| 2.004000000000005 | -7.508 | -0.445 | -0.037 |
| 2.008000000000005 | -7.471 | -0.44 | -0.036 |
| 2.012000000000005 | -7.433 | -0.435 | -0.035 |
| 2.016000000000005 | -7.395 | -0.43 | -0.035 |
| 2.020000000000005 | -7.358 | -0.425 | -0.034 |
| 2.024000000000005 | -7.32 | -0.421 | -0.033 |
| 2.028000000000005 | -7.282 | -0.416 | -0.033 |
| 2.032000000000005 | -7.244 | -0.411 | -0.032 |
| 2.036000000000005 | -7.206 | -0.406 | -0.032 |
| 2.040000000000005 | -7.168 | -0.401 | -0.031 |
| 2.044000000000005 | -7.129 | -0.397 | -0.03 |
| 2.048000000000005 | -7.091 | -0.392 | -0.03 |
| 2.052000000000005 | -7.053 | -0.387 | -0.029 |
| 2.056000000000005 | -7.015 | -0.382 | -0.029 |
| 2.060000000000005 | -6.976 | -0.378 | -0.028 |
| 2.064000000000005 | -6.938 | -0.373 | -0.028 |
| 2.068000000000005 | -6.9 | -0.369 | -0.027 |
| 2.072000000000005 | -6.861 | -0.364 | -0.026 |
| 2.076000000000005 | -6.823 | -0.36 | -0.026 |
| 2.080000000000005 | -6.784 | -0.355 | -0.025 |
| 2.084000000000005 | -6.746 | -0.351 | -0.025 |
| 2.088000000000005 | -6.707 | -0.347 | -0.024 |
| 2.092000000000005 | -6.668 | -0.342 | -0.024 |
| 2.096000000000005 | -6.63 | -0.338 | -0.023 |
| 2.100000000000005 | -6.591 | -0.334 | -0.023 |
| 2.104000000000005 | -6.553 | -0.329 | -0.023 |
| 2.108000000000005 | -6.514 | -0.325 | -0.022 |
| 2.112000000000005 | -6.475 | -0.321 | -0.022 |
| 2.116000000000005 | -6.437 | -0.317 | -0.021 |
| 2.120000000000005 | -6.398 | -0.313 | -0.021 |
| 2.124000000000005 | -6.359 | -0.309 | -0.02 |
| 2.128000000000005 | -6.321 | -0.305 | -0.02 |
| 2.132000000000005 | -6.282 | -0.301 | -0.019 |
| 2.136000000000005 | -6.243 | -0.297 | -0.019 |
| 2.140000000000005 | -6.205 | -0.293 | -0.019 |
| 2.144000000000005 | -6.166 | -0.289 | -0.018 |
| 2.148000000000005 | -6.128 | -0.285 | -0.018 |
| 2.152000000000005 | -6.089 | -0.281 | -0.018 |
| 2.156000000000005 | -6.05 | -0.277 | -0.017 |
| 2.160000000000005 | -6.012 | -0.274 | -0.017 |
| 2.164000000000005 | -5.973 | -0.27 | -0.016 |
| 2.168000000000005 | -5.935 | -0.266 | -0.016 |
| 2.172000000000005 | -5.896 | -0.263 | -0.016 |
| 2.176000000000005 | -5.858 | -0.259 | -0.015 |
| 2.180000000000005 | -5.819 | -0.255 | -0.015 |
| 2.184000000000005 | -5.781 | -0.252 | -0.015 |
| 2.188000000000005 | -5.743 | -0.248 | -0.014 |
| 2.192000000000005 | -5.704 | -0.245 | -0.014 |
| 2.196000000000005 | -5.666 | -0.241 | -0.014 |
| 2.200000000000005 | -5.628 | -0.238 | -0.013 |
| 2.204000000000005 | -5.59 | -0.235 | -0.013 |
| 2.208000000000005 | -5.552 | -0.231 | -0.013 |
| 2.212000000000005 | -5.514 | -0.228 | -0.013 |
| 2.216000000000005 | -5.476 | -0.225 | -0.012 |
| 2.220000000000005 | -5.438 | -0.221 | -0.012 |
| 2.224000000000005 | -5.4 | -0.218 | -0.012 |
| 2.228000000000005 | -5.362 | -0.215 | -0.011 |
| 2.232000000000005 | -5.324 | -0.212 | -0.011 |
| 2.236000000000005 | -5.287 | -0.209 | -0.011 |
| 2.240000000000005 | -5.249 | -0.206 | -0.011 |
| 2.244000000000005 | -5.211 | -0.203 | -0.01 |
| 2.248000000000005 | -5.174 | -0.2 | -0.01 |
| 2.252000000000005 | -5.136 | -0.197 | -0.01 |
| 2.256000000000005 | -5.099 | -0.194 | -0.01 |
| 2.260000000000005 | -5.062 | -0.191 | -0.01 |
| 2.264000000000005 | -5.025 | -0.188 | -0.009 |
| 2.268000000000005 | -4.988 | -0.185 | -0.009 |
| 2.272000000000005 | -4.951 | -0.182 | -0.009 |
| 2.276000000000005 | -4.914 | -0.179 | -0.009 |
| 2.280000000000005 | -4.877 | -0.177 | -0.008 |
| 2.284000000000005 | -4.84 | -0.174 | -0.008 |
| 2.288000000000005 | -4.803 | -0.171 | -0.008 |
| 2.292000000000005 | -4.767 | -0.169 | -0.008 |
| 2.296000000000005 | -4.73 | -0.166 | -0.008 |
| 2.300000000000005 | -4.694 | -0.163 | -0.008 |
| 2.304000000000005 | -4.658 | -0.161 | -0.007 |
| 2.308000000000005 | -4.621 | -0.158 | -0.007 |
| 2.312000000000005 | -4.585 | -0.156 | -0.007 |
| 2.316000000000005 | -4.549 | -0.153 | -0.007 |
| 2.320000000000005 | -4.514 | -0.151 | -0.007 |
| 2.324000000000005 | -4.478 | -0.148 | -0.006 |
| 2.328000000000005 | -4.442 | -0.146 | -0.006 |
| 2.332000000000005 | -4.407 | -0.144 | -0.006 |
| 2.336000000000005 | -4.371 | -0.141 | -0.006 |
| 2.340000000000005 | -4.336 | -0.139 | -0.006 |
| 2.344000000000005 | -4.301 | -0.137 | -0.006 |
| 2.348000000000005 | -4.266 | -0.135 | -0.006 |
| 2.352000000000005 | -4.231 | -0.132 | -0.005 |
| 2.356000000000005 | -4.196 | -0.13 | -0.005 |
| 2.360000000000005 | -4.161 | -0.128 | -0.005 |
| 2.364000000000005 | -4.127 | -0.126 | -0.005 |
| 2.368000000000005 | -4.092 | -0.124 | -0.005 |
| 2.372000000000005 | -4.058 | -0.122 | -0.005 |
| 2.376000000000005 | -4.024 | -0.12 | -0.005 |
| 2.380000000000005 | -3.99 | -0.118 | -0.005 |
| 2.384000000000005 | -3.956 | -0.116 | -0.004 |
| 2.388000000000005 | -3.922 | -0.114 | -0.004 |
| 2.392000000000005 | -3.888 | -0.112 | -0.004 |
| 2.396000000000005 | -3.855 | -0.11 | -0.004 |
| 2.400000000000005 | -3.822 | -0.108 | -0.004 |
| 2.404000000000005 | -3.788 | -0.106 | -0.004 |
| 2.408000000000005 | -3.755 | -0.104 | -0.004 |
| 2.412000000000005 | -3.722 | -0.103 | -0.004 |
| 2.416000000000005 | -3.69 | -0.101 | -0.004 |
| 2.420000000000005 | -3.657 | -0.099 | -0.003 |
| 2.424000000000005 | -3.624 | -0.097 | -0.003 |
| 2.428000000000005 | -3.592 | -0.096 | -0.003 |
| 2.432000000000005 | -3.56 | -0.094 | -0.003 |
| 2.436000000000005 | -3.528 | -0.092 | -0.003 |
| 2.440000000000005 | -3.496 | -0.091 | -0.003 |
| 2.444000000000005 | -3.464 | -0.089 | -0.003 |
| 2.448000000000005 | -3.432 | -0.087 | -0.003 |
| 2.452000000000005 | -3.401 | -0.086 | -0.003 |
| 2.456000000000005 | -3.37 | -0.084 | -0.003 |
| 2.460000000000005 | -3.339 | -0.083 | -0.003 |
| 2.464000000000005 | -3.308 | -0.081 | -0.003 |
| 2.468000000000005 | -3.277 | -0.08 | -0.003 |
| 2.472000000000005 | -3.246 | -0.078 | -0.002 |
| 2.476000000000005 | -3.216 | -0.077 | -0.002 |
| 2.480000000000005 | -3.185 | -0.076 | -0.002 |
| 2.484000000000005 | -3.155 | -0.074 | -0.002 |
| 2.488000000000005 | -3.125 | -0.073 | -0.002 |
| 2.492000000000005 | -3.095 | -0.071 | -0.002 |
| 2.496000000000005 | -3.065 | -0.07 | -0.002 |
| 2.500000000000005 | -3.036 | -0.069 | -0.002 |
| 2.504000000000005 | -3.006 | -0.068 | -0.002 |
| 2.508000000000005 | -2.977 | -0.066 | -0.002 |
| 2.512000000000005 | -2.948 | -0.065 | -0.002 |
| 2.516000000000005 | -2.919 | -0.064 | -0.002 |
| 2.520000000000005 | -2.891 | -0.063 | -0.002 |
| 2.524000000000005 | -2.862 | -0.061 | -0.002 |
| 2.528000000000005 | -2.834 | -0.06 | -0.002 |
| 2.532000000000005 | -2.806 | -0.059 | -0.002 |
| 2.536000000000005 | -2.777 | -0.058 | -0.002 |
| 2.540000000000005 | -2.75 | -0.057 | -0.002 |
| 2.544000000000005 | -2.722 | -0.056 | -0.001 |
| 2.548000000000005 | -2.694 | -0.055 | -0.001 |
| 2.552000000000005 | -2.667 | -0.054 | -0.001 |
| 2.556000000000005 | -2.64 | -0.053 | -0.001 |
| 2.560000000000005 | -2.613 | -0.052 | -0.001 |
| 2.564000000000005 | -2.586 | -0.051 | -0.001 |
| 2.568000000000005 | -2.559 | -0.05 | -0.001 |
| 2.572000000000005 | -2.533 | -0.049 | -0.001 |
| 2.576000000000005 | -2.507 | -0.048 | -0.001 |
| 2.580000000000005 | -2.48 | -0.047 | -0.001 |
| 2.584000000000005 | -2.454 | -0.046 | -0.001 |
| 2.588000000000005 | -2.429 | -0.045 | -0.001 |
| 2.592000000000005 | -2.403 | -0.044 | -0.001 |
| 2.596000000000005 | -2.378 | -0.043 | -0.001 |
| 2.600000000000005 | -2.352 | -0.042 | -0.001 |
| 2.604000000000005 | -2.327 | -0.041 | -0.001 |
| 2.608000000000005 | -2.302 | -0.041 | -0.001 |
| 2.612000000000005 | -2.278 | -0.04 | -0.001 |
| 2.616000000000005 | -2.253 | -0.039 | -0.001 |
| 2.620000000000005 | -2.229 | -0.038 | -0.001 |
| 2.624000000000005 | -2.204 | -0.037 | -0.001 |
| 2.628000000000005 | -2.18 | -0.037 | -0.001 |
| 2.632000000000005 | -2.157 | -0.036 | -0.001 |
| 2.636000000000005 | -2.133 | -0.035 | -0.001 |
| 2.640000000000005 | -2.109 | -0.034 | -0.001 |
| 2.644000000000005 | -2.086 | -0.034 | -0.001 |
| 2.648000000000005 | -2.063 | -0.033 | -0.001 |
| 2.652000000000005 | -2.04 | -0.032 | -0.001 |
| 2.656000000000005 | -2.017 | -0.032 | -0.001 |
| 2.660000000000005 | -1.994 | -0.031 | -0.001 |
| 2.664000000000005 | -1.972 | -0.03 | -0.001 |
| 2.668000000000005 | -1.95 | -0.03 | -0.001 |
| 2.672000000000005 | -1.928 | -0.029 | -0.001 |
| 2.676000000000005 | -1.906 | -0.028 | -0.001 |
| 2.680000000000005 | -1.884 | -0.028 | -0.001 |
| 2.684000000000005 | -1.862 | -0.027 | -0.001 |
| 2.688000000000005 | -1.841 | -0.027 | 0 |
| 2.692000000000005 | -1.82 | -0.026 | 0 |
| 2.696000000000005 | -1.799 | -0.025 | 0 |
| 2.700000000000005 | -1.778 | -0.025 | 0 |
| 2.704000000000005 | -1.757 | -0.024 | 0 |
| 2.708000000000005 | -1.736 | -0.024 | 0 |
| 2.712000000000005 | -1.716 | -0.023 | 0 |
| 2.716000000000005 | -1.696 | -0.023 | 0 |
| 2.720000000000005 | -1.676 | -0.022 | 0 |
| 2.724000000000005 | -1.656 | -0.022 | 0 |
| 2.728000000000005 | -1.636 | -0.021 | 0 |
| 2.732000000000005 | -1.617 | -0.021 | 0 |
| 2.736000000000005 | -1.597 | -0.02 | 0 |
| 2.740000000000005 | -1.578 | -0.02 | 0 |
| 2.744000000000005 | -1.559 | -0.02 | 0 |
| 2.748000000000005 | -1.54 | -0.019 | 0 |
| 2.752000000000005 | -1.522 | -0.019 | 0 |
| 2.756000000000005 | -1.503 | -0.018 | 0 |
| 2.760000000000005 | -1.485 | -0.018 | 0 |
| 2.764000000000005 | -1.466 | -0.017 | 0 |
| 2.768000000000005 | -1.448 | -0.017 | 0 |
| 2.772000000000005 | -1.431 | -0.017 | 0 |
| 2.776000000000005 | -1.413 | -0.016 | 0 |
| 2.780000000000005 | -1.395 | -0.016 | 0 |
| 2.784000000000005 | -1.378 | -0.016 | 0 |
| 2.788000000000006 | -1.361 | -0.015 | 0 |
| 2.792000000000005 | -1.344 | -0.015 | 0 |
| 2.796000000000005 | -1.327 | -0.015 | 0 |
| 2.800000000000006 | -1.31 | -0.014 | 0 |
| 2.804000000000006 | -1.293 | -0.014 | 0 |
| 2.808000000000006 | -1.277 | -0.014 | 0 |
| 2.812000000000006 | -1.261 | -0.013 | 0 |
| 2.816000000000006 | -1.245 | -0.013 | 0 |
| 2.820000000000006 | -1.229 | -0.013 | 0 |
| 2.824000000000006 | -1.213 | -0.012 | 0 |
| 2.828000000000006 | -1.197 | -0.012 | 0 |
| 2.832000000000006 | -1.182 | -0.012 | 0 |
| 2.836000000000006 | -1.166 | -0.011 | 0 |
| 2.840000000000006 | -1.151 | -0.011 | 0 |
| 2.844000000000006 | -1.136 | -0.011 | 0 |
| 2.848000000000006 | -1.121 | -0.011 | 0 |
| 2.852000000000006 | -1.107 | -0.01 | 0 |
| 2.856000000000006 | -1.092 | -0.01 | 0 |
| 2.860000000000006 | -1.078 | -0.01 | 0 |
| 2.864000000000006 | -1.063 | -0.01 | 0 |
| 2.868000000000006 | -1.049 | -0.009 | 0 |
| 2.872000000000006 | -1.035 | -0.009 | 0 |
| 2.876000000000006 | -1.021 | -0.009 | 0 |
| 2.880000000000006 | -1.008 | -0.009 | 0 |
| 2.884000000000006 | -0.994 | -0.009 | 0 |
| 2.888000000000006 | -0.981 | -0.008 | 0 |
| 2.892000000000006 | -0.967 | -0.008 | 0 |
| 2.896000000000006 | -0.954 | -0.008 | 0 |
| 2.900000000000006 | -0.941 | -0.008 | 0 |
| 2.904000000000006 | -0.928 | -0.008 | 0 |
| 2.908000000000006 | -0.916 | -0.007 | 0 |
| 2.912000000000006 | -0.903 | -0.007 | 0 |
| 2.916000000000006 | -0.891 | -0.007 | 0 |
| 2.920000000000006 | -0.878 | -0.007 | 0 |
| 2.924000000000006 | -0.866 | -0.007 | 0 |
| 2.928000000000006 | -0.854 | -0.007 | 0 |
| 2.932000000000006 | -0.842 | -0.006 | 0 |
| 2.936000000000006 | -0.831 | -0.006 | 0 |
| 2.940000000000006 | -0.819 | -0.006 | 0 |
| 2.944000000000006 | -0.807 | -0.006 | 0 |
| 2.948000000000006 | -0.796 | -0.006 | 0 |
| 2.952000000000006 | -0.785 | -0.006 | 0 |
| 2.956000000000006 | -0.774 | -0.005 | 0 |
| 2.960000000000006 | -0.763 | -0.005 | 0 |
| 2.964000000000006 | -0.752 | -0.005 | 0 |
| 2.968000000000006 | -0.741 | -0.005 | 0 |
| 2.972000000000006 | -0.73 | -0.005 | 0 |
| 2.976000000000006 | -0.72 | -0.005 | 0 |
| 2.980000000000006 | -0.71 | -0.005 | 0 |
| 2.984000000000006 | -0.699 | -0.005 | 0 |
| 2.988000000000006 | -0.689 | -0.004 | 0 |
| 2.992000000000006 | -0.679 | -0.004 | 0 |
| 2.996000000000006 | -0.669 | -0.004 | 0 |
| 3.000000000000006 | -0.66 | -0.004 | 0 |
| 3.004000000000006 | -0.65 | -0.004 | 0 |
| 3.008000000000006 | -0.64 | -0.004 | 0 |
| 3.012000000000006 | -0.631 | -0.004 | 0 |
| 3.016000000000006 | -0.622 | -0.004 | 0 |
| 3.020000000000006 | -0.612 | -0.004 | 0 |
| 3.024000000000006 | -0.603 | -0.004 | 0 |
| 3.028000000000006 | -0.594 | -0.003 | 0 |
| 3.032000000000006 | -0.585 | -0.003 | 0 |
| 3.036000000000006 | -0.577 | -0.003 | 0 |
| 3.040000000000006 | -0.568 | -0.003 | 0 |
| 3.044000000000006 | -0.56 | -0.003 | 0 |
| 3.048000000000006 | -0.551 | -0.003 | 0 |
| 3.052000000000006 | -0.543 | -0.003 | 0 |
| 3.056000000000006 | -0.535 | -0.003 | 0 |
| 3.060000000000006 | -0.526 | -0.003 | 0 |
| 3.064000000000006 | -0.518 | -0.003 | 0 |
| 3.068000000000006 | -0.51 | -0.003 | 0 |
| 3.072000000000006 | -0.503 | -0.003 | 0 |
| 3.076000000000006 | -0.495 | -0.002 | 0 |
| 3.080000000000006 | -0.487 | -0.002 | 0 |
| 3.084000000000006 | -0.48 | -0.002 | 0 |
| 3.088000000000006 | -0.472 | -0.002 | 0 |
| 3.092000000000006 | -0.465 | -0.002 | 0 |
| 3.096000000000006 | -0.458 | -0.002 | 0 |
| 3.100000000000006 | -0.451 | -0.002 | 0 |
| 3.104000000000006 | -0.444 | -0.002 | 0 |
| 3.108000000000006 | -0.437 | -0.002 | 0 |
| 3.112000000000006 | -0.43 | -0.002 | 0 |
| 3.116000000000006 | -0.423 | -0.002 | 0 |
| 3.120000000000006 | -0.416 | -0.002 | 0 |
| 3.124000000000006 | -0.41 | -0.002 | 0 |
| 3.128000000000006 | -0.403 | -0.002 | 0 |
| 3.132000000000006 | -0.397 | -0.002 | 0 |
| 3.136000000000006 | -0.391 | -0.002 | 0 |
| 3.140000000000006 | -0.384 | -0.002 | 0 |
| 3.144000000000006 | -0.378 | -0.002 | 0 |
| 3.148000000000006 | -0.372 | -0.001 | 0 |
| 3.152000000000006 | -0.366 | -0.001 | 0 |
| 3.156000000000006 | -0.36 | -0.001 | 0 |
| 3.160000000000006 | -0.354 | -0.001 | 0 |
| 3.164000000000006 | -0.349 | -0.001 | 0 |
| 3.168000000000006 | -0.343 | -0.001 | 0 |
| 3.172000000000006 | -0.337 | -0.001 | 0 |
| 3.176000000000006 | -0.332 | -0.001 | 0 |
| 3.180000000000006 | -0.326 | -0.001 | 0 |
| 3.184000000000006 | -0.321 | -0.001 | 0 |
| 3.188000000000006 | -0.316 | -0.001 | 0 |
| 3.192000000000006 | -0.311 | -0.001 | 0 |
| 3.196000000000006 | -0.305 | -0.001 | 0 |
| 3.200000000000006 | -0.3 | -0.001 | 0 |
| 3.204000000000006 | -0.295 | -0.001 | 0 |
| 3.208000000000006 | -0.29 | -0.001 | 0 |
| 3.212000000000006 | -0.286 | -0.001 | 0 |
| 3.216000000000006 | -0.281 | -0.001 | 0 |
| 3.220000000000006 | -0.276 | -0.001 | 0 |
| 3.224000000000006 | -0.271 | -0.001 | 0 |
| 3.228000000000006 | -0.267 | -0.001 | 0 |
| 3.232000000000006 | -0.262 | -0.001 | 0 |
| 3.236000000000006 | -0.258 | -0.001 | 0 |
| 3.240000000000006 | -0.254 | -0.001 | 0 |
| 3.244000000000006 | -0.249 | -0.001 | 0 |
| 3.248000000000006 | -0.245 | -0.001 | 0 |
| 3.252000000000006 | -0.241 | -0.001 | 0 |
| 3.256000000000006 | -0.237 | -0.001 | 0 |
| 3.260000000000006 | -0.233 | -0.001 | 0 |
| 3.264000000000006 | -0.229 | -0.001 | 0 |
| 3.268000000000006 | -0.225 | -0.001 | 0 |
| 3.272000000000006 | -0.221 | -0.001 | 0 |
| 3.276000000000006 | -0.217 | -0.001 | 0 |
| 3.280000000000006 | -0.213 | -0.001 | 0 |
| 3.284000000000006 | -0.209 | -0.001 | 0 |
| 3.288000000000006 | -0.206 | -0.001 | 0 |
| 3.292000000000006 | -0.202 | -0.001 | 0 |
| 3.296000000000006 | -0.199 | -0.001 | 0 |
| 3.300000000000006 | -0.195 | 0 | 0 |
| 3.304000000000006 | -0.192 | 0 | 0 |
| 3.308000000000006 | -0.188 | 0 | 0 |
| 3.312000000000006 | -0.185 | 0 | 0 |
| 3.316000000000006 | -0.182 | 0 | 0 |
| 3.320000000000006 | -0.179 | 0 | 0 |
| 3.324000000000006 | -0.175 | 0 | 0 |
| 3.328000000000006 | -0.172 | 0 | 0 |
| 3.332000000000006 | -0.169 | 0 | 0 |
| 3.336000000000006 | -0.166 | 0 | 0 |
| 3.340000000000006 | -0.163 | 0 | 0 |
| 3.344000000000006 | -0.16 | 0 | 0 |
| 3.348000000000006 | -0.157 | 0 | 0 |
| 3.352000000000006 | -0.154 | 0 | 0 |
| 3.356000000000006 | -0.152 | 0 | 0 |
| 3.360000000000006 | -0.149 | 0 | 0 |
| 3.364000000000006 | -0.146 | 0 | 0 |
| 3.368000000000006 | -0.144 | 0 | 0 |
| 3.372000000000006 | -0.141 | 0 | 0 |
| 3.376000000000006 | -0.138 | 0 | 0 |
| 3.380000000000006 | -0.136 | 0 | 0 |
| 3.384000000000006 | -0.133 | 0 | 0 |
| 3.388000000000006 | -0.131 | 0 | 0 |
| 3.392000000000006 | -0.128 | 0 | 0 |
| 3.396000000000006 | -0.126 | 0 | 0 |
| 3.400000000000006 | -0.124 | 0 | 0 |
| 3.404000000000006 | -0.121 | 0 | 0 |
| 3.408000000000006 | -0.119 | 0 | 0 |
| 3.412000000000006 | -0.117 | 0 | 0 |
| 3.416000000000006 | -0.115 | 0 | 0 |
| 3.420000000000006 | -0.113 | 0 | 0 |
| 3.424000000000006 | -0.111 | 0 | 0 |
| 3.428000000000006 | -0.108 | 0 | 0 |
| 3.432000000000006 | -0.106 | 0 | 0 |
| 3.436000000000006 | -0.104 | 0 | 0 |
| 3.440000000000006 | -0.102 | 0 | 0 |
| 3.444000000000006 | -0.1 | 0 | 0 |
| 3.448000000000006 | -0.099 | 0 | 0 |
| 3.452000000000006 | -0.097 | 0 | 0 |
| 3.456000000000006 | -0.095 | 0 | 0 |
| 3.460000000000006 | -0.093 | 0 | 0 |
| 3.464000000000006 | -0.091 | 0 | 0 |
| 3.468000000000006 | -0.089 | 0 | 0 |
| 3.472000000000006 | -0.088 | 0 | 0 |
| 3.476000000000006 | -0.086 | 0 | 0 |
| 3.480000000000006 | -0.084 | 0 | 0 |
| 3.484000000000006 | -0.083 | 0 | 0 |
| 3.488000000000006 | -0.081 | 0 | 0 |
| 3.492000000000006 | -0.08 | 0 | 0 |
| 3.496000000000006 | -0.078 | 0 | 0 |
| 3.500000000000006 | -0.077 | 0 | 0 |
| 3.504000000000006 | -0.075 | 0 | 0 |
| 3.508000000000006 | -0.074 | 0 | 0 |
| 3.512000000000006 | -0.072 | 0 | 0 |
| 3.516000000000006 | -0.071 | 0 | 0 |
| 3.520000000000006 | -0.069 | 0 | 0 |
| 3.524000000000006 | -0.068 | 0 | 0 |
| 3.528000000000006 | -0.067 | 0 | 0 |
| 3.532000000000006 | -0.065 | 0 | 0 |
| 3.536000000000006 | -0.064 | 0 | 0 |
| 3.540000000000006 | -0.063 | 0 | 0 |
| 3.544000000000006 | -0.061 | 0 | 0 |
| 3.548000000000006 | -0.06 | 0 | 0 |
| 3.552000000000006 | -0.059 | 0 | 0 |
| 3.556000000000006 | -0.058 | 0 | 0 |
| 3.560000000000006 | -0.057 | 0 | 0 |
| 3.564000000000006 | -0.056 | 0 | 0 |
| 3.568000000000006 | -0.054 | 0 | 0 |
| 3.572000000000006 | -0.053 | 0 | 0 |
| 3.576000000000006 | -0.052 | 0 | 0 |
| 3.580000000000006 | -0.051 | 0 | 0 |
| 3.584000000000006 | -0.05 | 0 | 0 |
| 3.588000000000006 | -0.049 | 0 | 0 |
| 3.592000000000006 | -0.048 | 0 | 0 |
| 3.596000000000006 | -0.047 | 0 | 0 |
| 3.600000000000006 | -0.046 | 0 | 0 |
| 3.604000000000006 | -0.045 | 0 | 0 |
| 3.608000000000006 | -0.044 | 0 | 0 |
| 3.612000000000006 | -0.043 | 0 | 0 |
| 3.616000000000006 | -0.043 | 0 | 0 |
| 3.620000000000006 | -0.042 | 0 | 0 |
| 3.624000000000006 | -0.041 | 0 | 0 |
| 3.628000000000006 | -0.04 | 0 | 0 |
| 3.632000000000006 | -0.039 | 0 | 0 |
| 3.636000000000006 | -0.038 | 0 | 0 |
| 3.640000000000006 | -0.037 | 0 | 0 |
| 3.644000000000006 | -0.037 | 0 | 0 |
| 3.648000000000006 | -0.036 | 0 | 0 |
| 3.652000000000006 | -0.035 | 0 | 0 |
| 3.656000000000006 | -0.034 | 0 | 0 |
| 3.660000000000006 | -0.034 | 0 | 0 |
| 3.664000000000006 | -0.033 | 0 | 0 |
| 3.668000000000006 | -0.032 | 0 | 0 |
| 3.672000000000006 | -0.032 | 0 | 0 |
| 3.676000000000006 | -0.031 | 0 | 0 |
| 3.680000000000006 | -0.03 | 0 | 0 |
| 3.684000000000006 | -0.03 | 0 | 0 |
| 3.688000000000006 | -0.029 | 0 | 0 |
| 3.692000000000006 | -0.028 | 0 | 0 |
| 3.696000000000006 | -0.028 | 0 | 0 |
| 3.700000000000006 | -0.027 | 0 | 0 |
| 3.704000000000006 | -0.027 | 0 | 0 |
| 3.708000000000006 | -0.026 | 0 | 0 |
| 3.712000000000006 | -0.025 | 0 | 0 |
| 3.716000000000006 | -0.025 | 0 | 0 |
| 3.720000000000006 | -0.024 | 0 | 0 |
| 3.724000000000006 | -0.024 | 0 | 0 |
| 3.728000000000006 | -0.023 | 0 | 0 |
| 3.732000000000006 | -0.023 | 0 | 0 |
| 3.736000000000006 | -0.022 | 0 | 0 |
| 3.740000000000006 | -0.022 | 0 | 0 |
| 3.744000000000006 | -0.021 | 0 | 0 |
| 3.748000000000006 | -0.021 | 0 | 0 |
| 3.752000000000006 | -0.02 | 0 | 0 |
| 3.756000000000006 | -0.02 | 0 | 0 |
| 3.760000000000006 | -0.02 | 0 | 0 |
| 3.764000000000006 | -0.019 | 0 | 0 |
| 3.768000000000006 | -0.019 | 0 | 0 |
| 3.772000000000006 | -0.018 | 0 | 0 |
| 3.776000000000006 | -0.018 | 0 | 0 |
| 3.780000000000006 | -0.018 | 0 | 0 |
| 3.784000000000006 | -0.017 | 0 | 0 |
| 3.788000000000006 | -0.017 | 0 | 0 |
| 3.792000000000006 | -0.016 | 0 | 0 |
| 3.796000000000006 | -0.016 | 0 | 0 |
| 3.800000000000006 | -0.016 | 0 | 0 |
| 3.804000000000006 | -0.015 | 0 | 0 |
| 3.808000000000006 | -0.015 | 0 | 0 |
| 3.812000000000006 | -0.015 | 0 | 0 |
| 3.816000000000006 | -0.014 | 0 | 0 |
| 3.820000000000006 | -0.014 | 0 | 0 |
| 3.824000000000006 | -0.014 | 0 | 0 |
| 3.828000000000006 | -0.013 | 0 | 0 |
| 3.832000000000006 | -0.013 | 0 | 0 |
| 3.836000000000006 | -0.013 | 0 | 0 |
| 3.840000000000006 | -0.012 | 0 | 0 |
| 3.844000000000006 | -0.012 | 0 | 0 |
| 3.848000000000006 | -0.012 | 0 | 0 |
| 3.852000000000006 | -0.012 | 0 | 0 |
| 3.856000000000006 | -0.011 | 0 | 0 |
| 3.860000000000006 | -0.011 | 0 | 0 |
| 3.864000000000006 | -0.011 | 0 | 0 |
| 3.868000000000006 | -0.011 | 0 | 0 |
| 3.872000000000006 | -0.01 | 0 | 0 |
| 3.876000000000006 | -0.01 | 0 | 0 |
| 3.880000000000006 | -0.01 | 0 | 0 |
| 3.884000000000006 | -0.01 | 0 | 0 |
| 3.888000000000007 | -0.009 | 0 | 0 |
| 3.892000000000006 | -0.009 | 0 | 0 |
| 3.896000000000006 | -0.009 | 0 | 0 |
| 3.900000000000007 | -0.009 | 0 | 0 |
| 3.904000000000007 | -0.009 | 0 | 0 |
| 3.908000000000007 | -0.008 | 0 | 0 |
| 3.912000000000007 | -0.008 | 0 | 0 |
| 3.916000000000007 | -0.008 | 0 | 0 |
| 3.920000000000007 | -0.008 | 0 | 0 |
| 3.924000000000007 | -0.008 | 0 | 0 |
| 3.928000000000007 | -0.007 | 0 | 0 |
| 3.932000000000007 | -0.007 | 0 | 0 |
| 3.936000000000007 | -0.007 | 0 | 0 |
| 3.940000000000007 | -0.007 | 0 | 0 |
| 3.944000000000007 | -0.007 | 0 | 0 |
| 3.948000000000007 | -0.007 | 0 | 0 |
| 3.952000000000007 | -0.006 | 0 | 0 |
| 3.956000000000007 | -0.006 | 0 | 0 |
| 3.960000000000007 | -0.006 | 0 | 0 |
| 3.964000000000007 | -0.006 | 0 | 0 |
| 3.968000000000007 | -0.006 | 0 | 0 |
| 3.972000000000007 | -0.006 | 0 | 0 |
| 3.976000000000007 | -0.006 | 0 | 0 |
| 3.980000000000007 | -0.005 | 0 | 0 |
| 3.984000000000007 | -0.005 | 0 | 0 |
| 3.988000000000007 | -0.005 | 0 | 0 |
| 3.992000000000007 | -0.005 | 0 | 0 |
| 3.996000000000007 | -0.005 | 0 | 0 |
| 4.000000000000006 | -0.005 | 0 | 0 |